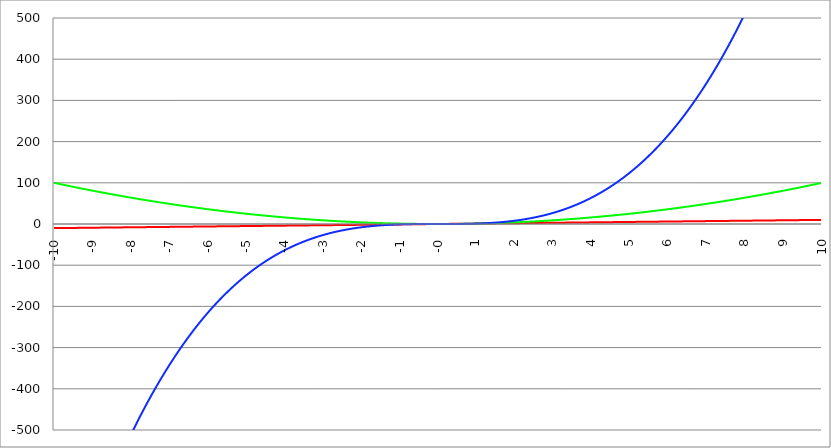
| Category | Series 1 | Series 0 | Series 2 |
|---|---|---|---|
| -10.0 | -10 | 100 | -1000 |
| -9.99 | -9.99 | 99.8 | -997.003 |
| -9.98 | -9.98 | 99.6 | -994.012 |
| -9.97 | -9.97 | 99.401 | -991.027 |
| -9.96 | -9.96 | 99.202 | -988.048 |
| -9.95 | -9.95 | 99.003 | -985.075 |
| -9.940000000000001 | -9.94 | 98.804 | -982.108 |
| -9.930000000000001 | -9.93 | 98.605 | -979.147 |
| -9.920000000000002 | -9.92 | 98.406 | -976.191 |
| -9.91 | -9.91 | 98.208 | -973.242 |
| -9.900000000000002 | -9.9 | 98.01 | -970.299 |
| -9.890000000000002 | -9.89 | 97.812 | -967.362 |
| -9.880000000000003 | -9.88 | 97.614 | -964.43 |
| -9.870000000000003 | -9.87 | 97.417 | -961.505 |
| -9.860000000000001 | -9.86 | 97.22 | -958.585 |
| -9.850000000000003 | -9.85 | 97.023 | -955.672 |
| -9.840000000000003 | -9.84 | 96.826 | -952.764 |
| -9.830000000000004 | -9.83 | 96.629 | -949.862 |
| -9.820000000000004 | -9.82 | 96.432 | -946.966 |
| -9.810000000000004 | -9.81 | 96.236 | -944.076 |
| -9.800000000000004 | -9.8 | 96.04 | -941.192 |
| -9.790000000000004 | -9.79 | 95.844 | -938.314 |
| -9.780000000000005 | -9.78 | 95.648 | -935.441 |
| -9.770000000000005 | -9.77 | 95.453 | -932.575 |
| -9.760000000000005 | -9.76 | 95.258 | -929.714 |
| -9.750000000000005 | -9.75 | 95.063 | -926.859 |
| -9.740000000000006 | -9.74 | 94.868 | -924.01 |
| -9.730000000000006 | -9.73 | 94.673 | -921.167 |
| -9.720000000000006 | -9.72 | 94.478 | -918.33 |
| -9.710000000000006 | -9.71 | 94.284 | -915.499 |
| -9.700000000000006 | -9.7 | 94.09 | -912.673 |
| -9.690000000000007 | -9.69 | 93.896 | -909.853 |
| -9.680000000000007 | -9.68 | 93.702 | -907.039 |
| -9.670000000000007 | -9.67 | 93.509 | -904.231 |
| -9.660000000000007 | -9.66 | 93.316 | -901.429 |
| -9.650000000000007 | -9.65 | 93.123 | -898.632 |
| -9.640000000000008 | -9.64 | 92.93 | -895.841 |
| -9.630000000000008 | -9.63 | 92.737 | -893.056 |
| -9.620000000000008 | -9.62 | 92.544 | -890.277 |
| -9.610000000000008 | -9.61 | 92.352 | -887.504 |
| -9.600000000000009 | -9.6 | 92.16 | -884.736 |
| -9.590000000000009 | -9.59 | 91.968 | -881.974 |
| -9.580000000000007 | -9.58 | 91.776 | -879.218 |
| -9.57000000000001 | -9.57 | 91.585 | -876.467 |
| -9.56000000000001 | -9.56 | 91.394 | -873.723 |
| -9.55000000000001 | -9.55 | 91.203 | -870.984 |
| -9.54000000000001 | -9.54 | 91.012 | -868.251 |
| -9.53000000000001 | -9.53 | 90.821 | -865.523 |
| -9.52000000000001 | -9.52 | 90.63 | -862.801 |
| -9.51000000000001 | -9.51 | 90.44 | -860.085 |
| -9.50000000000001 | -9.5 | 90.25 | -857.375 |
| -9.49000000000001 | -9.49 | 90.06 | -854.67 |
| -9.48000000000001 | -9.48 | 89.87 | -851.971 |
| -9.47000000000001 | -9.47 | 89.681 | -849.278 |
| -9.46000000000001 | -9.46 | 89.492 | -846.591 |
| -9.45000000000001 | -9.45 | 89.303 | -843.909 |
| -9.44000000000001 | -9.44 | 89.114 | -841.232 |
| -9.430000000000012 | -9.43 | 88.925 | -838.562 |
| -9.420000000000012 | -9.42 | 88.736 | -835.897 |
| -9.410000000000013 | -9.41 | 88.548 | -833.238 |
| -9.400000000000013 | -9.4 | 88.36 | -830.584 |
| -9.390000000000011 | -9.39 | 88.172 | -827.936 |
| -9.380000000000013 | -9.38 | 87.984 | -825.294 |
| -9.370000000000013 | -9.37 | 87.797 | -822.657 |
| -9.360000000000014 | -9.36 | 87.61 | -820.026 |
| -9.350000000000014 | -9.35 | 87.423 | -817.4 |
| -9.340000000000014 | -9.34 | 87.236 | -814.781 |
| -9.330000000000014 | -9.33 | 87.049 | -812.166 |
| -9.320000000000014 | -9.32 | 86.862 | -809.558 |
| -9.310000000000015 | -9.31 | 86.676 | -806.954 |
| -9.300000000000013 | -9.3 | 86.49 | -804.357 |
| -9.290000000000015 | -9.29 | 86.304 | -801.765 |
| -9.280000000000015 | -9.28 | 86.118 | -799.179 |
| -9.270000000000016 | -9.27 | 85.933 | -796.598 |
| -9.260000000000016 | -9.26 | 85.748 | -794.023 |
| -9.250000000000014 | -9.25 | 85.563 | -791.453 |
| -9.240000000000016 | -9.24 | 85.378 | -788.889 |
| -9.230000000000016 | -9.23 | 85.193 | -786.33 |
| -9.220000000000017 | -9.22 | 85.008 | -783.777 |
| -9.210000000000017 | -9.21 | 84.824 | -781.23 |
| -9.200000000000017 | -9.2 | 84.64 | -778.688 |
| -9.190000000000017 | -9.19 | 84.456 | -776.152 |
| -9.180000000000017 | -9.18 | 84.272 | -773.621 |
| -9.170000000000018 | -9.17 | 84.089 | -771.095 |
| -9.160000000000016 | -9.16 | 83.906 | -768.575 |
| -9.150000000000018 | -9.15 | 83.723 | -766.061 |
| -9.140000000000018 | -9.14 | 83.54 | -763.552 |
| -9.130000000000019 | -9.13 | 83.357 | -761.048 |
| -9.120000000000019 | -9.12 | 83.174 | -758.551 |
| -9.110000000000017 | -9.11 | 82.992 | -756.058 |
| -9.10000000000002 | -9.1 | 82.81 | -753.571 |
| -9.09000000000002 | -9.09 | 82.628 | -751.089 |
| -9.08000000000002 | -9.08 | 82.446 | -748.613 |
| -9.07000000000002 | -9.07 | 82.265 | -746.143 |
| -9.06000000000002 | -9.06 | 82.084 | -743.677 |
| -9.05000000000002 | -9.05 | 81.903 | -741.218 |
| -9.04000000000002 | -9.04 | 81.722 | -738.763 |
| -9.03000000000002 | -9.03 | 81.541 | -736.314 |
| -9.020000000000021 | -9.02 | 81.36 | -733.871 |
| -9.010000000000021 | -9.01 | 81.18 | -731.433 |
| -9.000000000000021 | -9 | 81 | -729 |
| -8.990000000000022 | -8.99 | 80.82 | -726.573 |
| -8.980000000000022 | -8.98 | 80.64 | -724.151 |
| -8.97000000000002 | -8.97 | 80.461 | -721.734 |
| -8.960000000000022 | -8.96 | 80.282 | -719.323 |
| -8.950000000000022 | -8.95 | 80.103 | -716.917 |
| -8.940000000000023 | -8.94 | 79.924 | -714.517 |
| -8.930000000000023 | -8.93 | 79.745 | -712.122 |
| -8.920000000000023 | -8.92 | 79.566 | -709.732 |
| -8.910000000000023 | -8.91 | 79.388 | -707.348 |
| -8.900000000000023 | -8.9 | 79.21 | -704.969 |
| -8.890000000000024 | -8.89 | 79.032 | -702.595 |
| -8.880000000000024 | -8.88 | 78.854 | -700.227 |
| -8.870000000000024 | -8.87 | 78.677 | -697.864 |
| -8.860000000000024 | -8.86 | 78.5 | -695.506 |
| -8.850000000000025 | -8.85 | 78.323 | -693.154 |
| -8.840000000000025 | -8.84 | 78.146 | -690.807 |
| -8.830000000000025 | -8.83 | 77.969 | -688.465 |
| -8.820000000000025 | -8.82 | 77.792 | -686.129 |
| -8.810000000000025 | -8.81 | 77.616 | -683.798 |
| -8.800000000000026 | -8.8 | 77.44 | -681.472 |
| -8.790000000000026 | -8.79 | 77.264 | -679.151 |
| -8.780000000000026 | -8.78 | 77.088 | -676.836 |
| -8.770000000000026 | -8.77 | 76.913 | -674.526 |
| -8.760000000000026 | -8.76 | 76.738 | -672.221 |
| -8.750000000000027 | -8.75 | 76.563 | -669.922 |
| -8.740000000000027 | -8.74 | 76.388 | -667.628 |
| -8.730000000000027 | -8.73 | 76.213 | -665.339 |
| -8.720000000000027 | -8.72 | 76.038 | -663.055 |
| -8.710000000000027 | -8.71 | 75.864 | -660.776 |
| -8.700000000000028 | -8.7 | 75.69 | -658.503 |
| -8.690000000000028 | -8.69 | 75.516 | -656.235 |
| -8.680000000000028 | -8.68 | 75.342 | -653.972 |
| -8.670000000000028 | -8.67 | 75.169 | -651.714 |
| -8.660000000000029 | -8.66 | 74.996 | -649.462 |
| -8.650000000000029 | -8.65 | 74.823 | -647.215 |
| -8.640000000000029 | -8.64 | 74.65 | -644.973 |
| -8.63000000000003 | -8.63 | 74.477 | -642.736 |
| -8.62000000000003 | -8.62 | 74.304 | -640.504 |
| -8.61000000000003 | -8.61 | 74.132 | -638.277 |
| -8.60000000000003 | -8.6 | 73.96 | -636.056 |
| -8.59000000000003 | -8.59 | 73.788 | -633.84 |
| -8.58000000000003 | -8.58 | 73.616 | -631.629 |
| -8.57000000000003 | -8.57 | 73.445 | -629.423 |
| -8.56000000000003 | -8.56 | 73.274 | -627.222 |
| -8.55000000000003 | -8.55 | 73.103 | -625.026 |
| -8.540000000000031 | -8.54 | 72.932 | -622.836 |
| -8.530000000000031 | -8.53 | 72.761 | -620.65 |
| -8.520000000000032 | -8.52 | 72.59 | -618.47 |
| -8.510000000000032 | -8.51 | 72.42 | -616.295 |
| -8.50000000000003 | -8.5 | 72.25 | -614.125 |
| -8.490000000000032 | -8.49 | 72.08 | -611.96 |
| -8.480000000000032 | -8.48 | 71.91 | -609.8 |
| -8.470000000000033 | -8.47 | 71.741 | -607.645 |
| -8.460000000000033 | -8.46 | 71.572 | -605.496 |
| -8.450000000000033 | -8.45 | 71.403 | -603.351 |
| -8.440000000000033 | -8.44 | 71.234 | -601.212 |
| -8.430000000000033 | -8.43 | 71.065 | -599.077 |
| -8.420000000000034 | -8.42 | 70.896 | -596.948 |
| -8.410000000000032 | -8.41 | 70.728 | -594.823 |
| -8.400000000000034 | -8.4 | 70.56 | -592.704 |
| -8.390000000000034 | -8.39 | 70.392 | -590.59 |
| -8.380000000000035 | -8.38 | 70.224 | -588.48 |
| -8.370000000000035 | -8.37 | 70.057 | -586.376 |
| -8.360000000000033 | -8.36 | 69.89 | -584.277 |
| -8.350000000000035 | -8.35 | 69.723 | -582.183 |
| -8.340000000000035 | -8.34 | 69.556 | -580.094 |
| -8.330000000000036 | -8.33 | 69.389 | -578.01 |
| -8.320000000000036 | -8.32 | 69.222 | -575.93 |
| -8.310000000000034 | -8.31 | 69.056 | -573.856 |
| -8.300000000000036 | -8.3 | 68.89 | -571.787 |
| -8.290000000000036 | -8.29 | 68.724 | -569.723 |
| -8.280000000000037 | -8.28 | 68.558 | -567.664 |
| -8.270000000000037 | -8.27 | 68.393 | -565.609 |
| -8.260000000000037 | -8.26 | 68.228 | -563.56 |
| -8.250000000000037 | -8.25 | 68.063 | -561.516 |
| -8.240000000000038 | -8.24 | 67.898 | -559.476 |
| -8.230000000000038 | -8.23 | 67.733 | -557.442 |
| -8.220000000000038 | -8.22 | 67.568 | -555.412 |
| -8.210000000000038 | -8.21 | 67.404 | -553.388 |
| -8.200000000000038 | -8.2 | 67.24 | -551.368 |
| -8.190000000000039 | -8.19 | 67.076 | -549.353 |
| -8.180000000000039 | -8.18 | 66.912 | -547.343 |
| -8.170000000000037 | -8.17 | 66.749 | -545.339 |
| -8.16000000000004 | -8.16 | 66.586 | -543.338 |
| -8.15000000000004 | -8.15 | 66.423 | -541.343 |
| -8.14000000000004 | -8.14 | 66.26 | -539.353 |
| -8.13000000000004 | -8.13 | 66.097 | -537.368 |
| -8.12000000000004 | -8.12 | 65.934 | -535.387 |
| -8.11000000000004 | -8.11 | 65.772 | -533.412 |
| -8.10000000000004 | -8.1 | 65.61 | -531.441 |
| -8.09000000000004 | -8.09 | 65.448 | -529.475 |
| -8.08000000000004 | -8.08 | 65.286 | -527.514 |
| -8.07000000000004 | -8.07 | 65.125 | -525.558 |
| -8.06000000000004 | -8.06 | 64.964 | -523.607 |
| -8.05000000000004 | -8.05 | 64.803 | -521.66 |
| -8.040000000000042 | -8.04 | 64.642 | -519.718 |
| -8.03000000000004 | -8.03 | 64.481 | -517.782 |
| -8.020000000000042 | -8.02 | 64.32 | -515.85 |
| -8.010000000000042 | -8.01 | 64.16 | -513.922 |
| -8.000000000000043 | -8 | 64 | -512 |
| -7.990000000000043 | -7.99 | 63.84 | -510.082 |
| -7.980000000000043 | -7.98 | 63.68 | -508.17 |
| -7.970000000000043 | -7.97 | 63.521 | -506.262 |
| -7.960000000000043 | -7.96 | 63.362 | -504.358 |
| -7.950000000000044 | -7.95 | 63.203 | -502.46 |
| -7.940000000000044 | -7.94 | 63.044 | -500.566 |
| -7.930000000000044 | -7.93 | 62.885 | -498.677 |
| -7.920000000000044 | -7.92 | 62.726 | -496.793 |
| -7.910000000000044 | -7.91 | 62.568 | -494.914 |
| -7.900000000000044 | -7.9 | 62.41 | -493.039 |
| -7.890000000000045 | -7.89 | 62.252 | -491.169 |
| -7.880000000000045 | -7.88 | 62.094 | -489.304 |
| -7.870000000000045 | -7.87 | 61.937 | -487.443 |
| -7.860000000000046 | -7.86 | 61.78 | -485.588 |
| -7.850000000000046 | -7.85 | 61.623 | -483.737 |
| -7.840000000000046 | -7.84 | 61.466 | -481.89 |
| -7.830000000000046 | -7.83 | 61.309 | -480.049 |
| -7.820000000000046 | -7.82 | 61.152 | -478.212 |
| -7.810000000000047 | -7.81 | 60.996 | -476.38 |
| -7.800000000000047 | -7.8 | 60.84 | -474.552 |
| -7.790000000000047 | -7.79 | 60.684 | -472.729 |
| -7.780000000000047 | -7.78 | 60.528 | -470.911 |
| -7.770000000000047 | -7.77 | 60.373 | -469.097 |
| -7.760000000000048 | -7.76 | 60.218 | -467.289 |
| -7.750000000000048 | -7.75 | 60.063 | -465.484 |
| -7.740000000000048 | -7.74 | 59.908 | -463.685 |
| -7.730000000000048 | -7.73 | 59.753 | -461.89 |
| -7.720000000000049 | -7.72 | 59.598 | -460.1 |
| -7.710000000000049 | -7.71 | 59.444 | -458.314 |
| -7.700000000000049 | -7.7 | 59.29 | -456.533 |
| -7.690000000000049 | -7.69 | 59.136 | -454.757 |
| -7.680000000000049 | -7.68 | 58.982 | -452.985 |
| -7.67000000000005 | -7.67 | 58.829 | -451.218 |
| -7.66000000000005 | -7.66 | 58.676 | -449.455 |
| -7.65000000000005 | -7.65 | 58.523 | -447.697 |
| -7.64000000000005 | -7.64 | 58.37 | -445.944 |
| -7.63000000000005 | -7.63 | 58.217 | -444.195 |
| -7.620000000000051 | -7.62 | 58.064 | -442.451 |
| -7.610000000000051 | -7.61 | 57.912 | -440.711 |
| -7.600000000000051 | -7.6 | 57.76 | -438.976 |
| -7.590000000000051 | -7.59 | 57.608 | -437.245 |
| -7.580000000000052 | -7.58 | 57.456 | -435.52 |
| -7.570000000000052 | -7.57 | 57.305 | -433.798 |
| -7.560000000000052 | -7.56 | 57.154 | -432.081 |
| -7.550000000000052 | -7.55 | 57.003 | -430.369 |
| -7.540000000000052 | -7.54 | 56.852 | -428.661 |
| -7.530000000000053 | -7.53 | 56.701 | -426.958 |
| -7.520000000000053 | -7.52 | 56.55 | -425.259 |
| -7.510000000000053 | -7.51 | 56.4 | -423.565 |
| -7.500000000000053 | -7.5 | 56.25 | -421.875 |
| -7.490000000000053 | -7.49 | 56.1 | -420.19 |
| -7.480000000000054 | -7.48 | 55.95 | -418.509 |
| -7.470000000000054 | -7.47 | 55.801 | -416.833 |
| -7.460000000000054 | -7.46 | 55.652 | -415.161 |
| -7.450000000000054 | -7.45 | 55.503 | -413.494 |
| -7.440000000000054 | -7.44 | 55.354 | -411.831 |
| -7.430000000000054 | -7.43 | 55.205 | -410.172 |
| -7.420000000000055 | -7.42 | 55.056 | -408.518 |
| -7.410000000000055 | -7.41 | 54.908 | -406.869 |
| -7.400000000000055 | -7.4 | 54.76 | -405.224 |
| -7.390000000000056 | -7.39 | 54.612 | -403.583 |
| -7.380000000000056 | -7.38 | 54.464 | -401.947 |
| -7.370000000000056 | -7.37 | 54.317 | -400.316 |
| -7.360000000000056 | -7.36 | 54.17 | -398.688 |
| -7.350000000000056 | -7.35 | 54.023 | -397.065 |
| -7.340000000000057 | -7.34 | 53.876 | -395.447 |
| -7.330000000000057 | -7.33 | 53.729 | -393.833 |
| -7.320000000000057 | -7.32 | 53.582 | -392.223 |
| -7.310000000000057 | -7.31 | 53.436 | -390.618 |
| -7.300000000000058 | -7.3 | 53.29 | -389.017 |
| -7.290000000000058 | -7.29 | 53.144 | -387.42 |
| -7.280000000000058 | -7.28 | 52.998 | -385.828 |
| -7.270000000000058 | -7.27 | 52.853 | -384.241 |
| -7.260000000000058 | -7.26 | 52.708 | -382.657 |
| -7.250000000000059 | -7.25 | 52.563 | -381.078 |
| -7.240000000000059 | -7.24 | 52.418 | -379.503 |
| -7.23000000000006 | -7.23 | 52.273 | -377.933 |
| -7.220000000000059 | -7.22 | 52.128 | -376.367 |
| -7.210000000000059 | -7.21 | 51.984 | -374.805 |
| -7.20000000000006 | -7.2 | 51.84 | -373.248 |
| -7.19000000000006 | -7.19 | 51.696 | -371.695 |
| -7.18000000000006 | -7.18 | 51.552 | -370.146 |
| -7.17000000000006 | -7.17 | 51.409 | -368.602 |
| -7.160000000000061 | -7.16 | 51.266 | -367.062 |
| -7.150000000000061 | -7.15 | 51.123 | -365.526 |
| -7.140000000000061 | -7.14 | 50.98 | -363.994 |
| -7.130000000000061 | -7.13 | 50.837 | -362.467 |
| -7.120000000000061 | -7.12 | 50.694 | -360.944 |
| -7.110000000000062 | -7.11 | 50.552 | -359.425 |
| -7.100000000000062 | -7.1 | 50.41 | -357.911 |
| -7.090000000000062 | -7.09 | 50.268 | -356.401 |
| -7.080000000000062 | -7.08 | 50.126 | -354.895 |
| -7.070000000000062 | -7.07 | 49.985 | -353.393 |
| -7.060000000000063 | -7.06 | 49.844 | -351.896 |
| -7.050000000000063 | -7.05 | 49.703 | -350.403 |
| -7.040000000000063 | -7.04 | 49.562 | -348.914 |
| -7.030000000000063 | -7.03 | 49.421 | -347.429 |
| -7.020000000000064 | -7.02 | 49.28 | -345.948 |
| -7.010000000000064 | -7.01 | 49.14 | -344.472 |
| -7.000000000000064 | -7 | 49 | -343 |
| -6.990000000000064 | -6.99 | 48.86 | -341.532 |
| -6.980000000000064 | -6.98 | 48.72 | -340.068 |
| -6.970000000000064 | -6.97 | 48.581 | -338.609 |
| -6.960000000000064 | -6.96 | 48.442 | -337.154 |
| -6.950000000000064 | -6.95 | 48.303 | -335.702 |
| -6.940000000000065 | -6.94 | 48.164 | -334.255 |
| -6.930000000000065 | -6.93 | 48.025 | -332.813 |
| -6.920000000000065 | -6.92 | 47.886 | -331.374 |
| -6.910000000000065 | -6.91 | 47.748 | -329.939 |
| -6.900000000000066 | -6.9 | 47.61 | -328.509 |
| -6.890000000000066 | -6.89 | 47.472 | -327.083 |
| -6.880000000000066 | -6.88 | 47.334 | -325.661 |
| -6.870000000000066 | -6.87 | 47.197 | -324.243 |
| -6.860000000000067 | -6.86 | 47.06 | -322.829 |
| -6.850000000000067 | -6.85 | 46.923 | -321.419 |
| -6.840000000000067 | -6.84 | 46.786 | -320.014 |
| -6.830000000000067 | -6.83 | 46.649 | -318.612 |
| -6.820000000000068 | -6.82 | 46.512 | -317.215 |
| -6.810000000000068 | -6.81 | 46.376 | -315.821 |
| -6.800000000000068 | -6.8 | 46.24 | -314.432 |
| -6.790000000000068 | -6.79 | 46.104 | -313.047 |
| -6.780000000000068 | -6.78 | 45.968 | -311.666 |
| -6.770000000000068 | -6.77 | 45.833 | -310.289 |
| -6.760000000000069 | -6.76 | 45.698 | -308.916 |
| -6.75000000000007 | -6.75 | 45.563 | -307.547 |
| -6.74000000000007 | -6.74 | 45.428 | -306.182 |
| -6.73000000000007 | -6.73 | 45.293 | -304.821 |
| -6.72000000000007 | -6.72 | 45.158 | -303.464 |
| -6.71000000000007 | -6.71 | 45.024 | -302.112 |
| -6.70000000000007 | -6.7 | 44.89 | -300.763 |
| -6.69000000000007 | -6.69 | 44.756 | -299.418 |
| -6.680000000000071 | -6.68 | 44.622 | -298.078 |
| -6.670000000000071 | -6.67 | 44.489 | -296.741 |
| -6.660000000000071 | -6.66 | 44.356 | -295.408 |
| -6.650000000000071 | -6.65 | 44.223 | -294.08 |
| -6.640000000000072 | -6.64 | 44.09 | -292.755 |
| -6.630000000000072 | -6.63 | 43.957 | -291.434 |
| -6.620000000000072 | -6.62 | 43.824 | -290.118 |
| -6.610000000000072 | -6.61 | 43.692 | -288.805 |
| -6.600000000000072 | -6.6 | 43.56 | -287.496 |
| -6.590000000000073 | -6.59 | 43.428 | -286.191 |
| -6.580000000000073 | -6.58 | 43.296 | -284.89 |
| -6.570000000000073 | -6.57 | 43.165 | -283.593 |
| -6.560000000000073 | -6.56 | 43.034 | -282.3 |
| -6.550000000000074 | -6.55 | 42.903 | -281.011 |
| -6.540000000000074 | -6.54 | 42.772 | -279.726 |
| -6.530000000000074 | -6.53 | 42.641 | -278.445 |
| -6.520000000000074 | -6.52 | 42.51 | -277.168 |
| -6.510000000000074 | -6.51 | 42.38 | -275.894 |
| -6.500000000000074 | -6.5 | 42.25 | -274.625 |
| -6.490000000000074 | -6.49 | 42.12 | -273.359 |
| -6.480000000000074 | -6.48 | 41.99 | -272.098 |
| -6.470000000000075 | -6.47 | 41.861 | -270.84 |
| -6.460000000000075 | -6.46 | 41.732 | -269.586 |
| -6.450000000000075 | -6.45 | 41.603 | -268.336 |
| -6.440000000000075 | -6.44 | 41.474 | -267.09 |
| -6.430000000000076 | -6.43 | 41.345 | -265.848 |
| -6.420000000000076 | -6.42 | 41.216 | -264.609 |
| -6.410000000000076 | -6.41 | 41.088 | -263.375 |
| -6.400000000000076 | -6.4 | 40.96 | -262.144 |
| -6.390000000000077 | -6.39 | 40.832 | -260.917 |
| -6.380000000000077 | -6.38 | 40.704 | -259.694 |
| -6.370000000000077 | -6.37 | 40.577 | -258.475 |
| -6.360000000000078 | -6.36 | 40.45 | -257.259 |
| -6.350000000000078 | -6.35 | 40.323 | -256.048 |
| -6.340000000000078 | -6.34 | 40.196 | -254.84 |
| -6.330000000000078 | -6.33 | 40.069 | -253.636 |
| -6.320000000000078 | -6.32 | 39.942 | -252.436 |
| -6.310000000000079 | -6.31 | 39.816 | -251.24 |
| -6.300000000000079 | -6.3 | 39.69 | -250.047 |
| -6.29000000000008 | -6.29 | 39.564 | -248.858 |
| -6.28000000000008 | -6.28 | 39.438 | -247.673 |
| -6.27000000000008 | -6.27 | 39.313 | -246.492 |
| -6.26000000000008 | -6.26 | 39.188 | -245.314 |
| -6.25000000000008 | -6.25 | 39.063 | -244.141 |
| -6.24000000000008 | -6.24 | 38.938 | -242.971 |
| -6.23000000000008 | -6.23 | 38.813 | -241.804 |
| -6.220000000000081 | -6.22 | 38.688 | -240.642 |
| -6.210000000000081 | -6.21 | 38.564 | -239.483 |
| -6.200000000000081 | -6.2 | 38.44 | -238.328 |
| -6.190000000000081 | -6.19 | 38.316 | -237.177 |
| -6.180000000000081 | -6.18 | 38.192 | -236.029 |
| -6.170000000000082 | -6.17 | 38.069 | -234.885 |
| -6.160000000000082 | -6.16 | 37.946 | -233.745 |
| -6.150000000000082 | -6.15 | 37.823 | -232.608 |
| -6.140000000000082 | -6.14 | 37.7 | -231.476 |
| -6.130000000000082 | -6.13 | 37.577 | -230.346 |
| -6.120000000000083 | -6.12 | 37.454 | -229.221 |
| -6.110000000000083 | -6.11 | 37.332 | -228.099 |
| -6.100000000000083 | -6.1 | 37.21 | -226.981 |
| -6.090000000000083 | -6.09 | 37.088 | -225.867 |
| -6.080000000000084 | -6.08 | 36.966 | -224.756 |
| -6.070000000000084 | -6.07 | 36.845 | -223.649 |
| -6.060000000000084 | -6.06 | 36.724 | -222.545 |
| -6.050000000000084 | -6.05 | 36.603 | -221.445 |
| -6.040000000000084 | -6.04 | 36.482 | -220.349 |
| -6.030000000000084 | -6.03 | 36.361 | -219.256 |
| -6.020000000000085 | -6.02 | 36.24 | -218.167 |
| -6.010000000000085 | -6.01 | 36.12 | -217.082 |
| -6.000000000000085 | -6 | 36 | -216 |
| -5.990000000000085 | -5.99 | 35.88 | -214.922 |
| -5.980000000000085 | -5.98 | 35.76 | -213.847 |
| -5.970000000000085 | -5.97 | 35.641 | -212.776 |
| -5.960000000000086 | -5.96 | 35.522 | -211.709 |
| -5.950000000000086 | -5.95 | 35.403 | -210.645 |
| -5.940000000000086 | -5.94 | 35.284 | -209.585 |
| -5.930000000000086 | -5.93 | 35.165 | -208.528 |
| -5.920000000000087 | -5.92 | 35.046 | -207.475 |
| -5.910000000000087 | -5.91 | 34.928 | -206.425 |
| -5.900000000000087 | -5.9 | 34.81 | -205.379 |
| -5.890000000000088 | -5.89 | 34.692 | -204.336 |
| -5.880000000000088 | -5.88 | 34.574 | -203.297 |
| -5.870000000000088 | -5.87 | 34.457 | -202.262 |
| -5.860000000000088 | -5.86 | 34.34 | -201.23 |
| -5.850000000000088 | -5.85 | 34.223 | -200.202 |
| -5.840000000000089 | -5.84 | 34.106 | -199.177 |
| -5.830000000000089 | -5.83 | 33.989 | -198.155 |
| -5.820000000000089 | -5.82 | 33.872 | -197.137 |
| -5.810000000000089 | -5.81 | 33.756 | -196.123 |
| -5.800000000000089 | -5.8 | 33.64 | -195.112 |
| -5.79000000000009 | -5.79 | 33.524 | -194.105 |
| -5.78000000000009 | -5.78 | 33.408 | -193.101 |
| -5.77000000000009 | -5.77 | 33.293 | -192.1 |
| -5.76000000000009 | -5.76 | 33.178 | -191.103 |
| -5.750000000000091 | -5.75 | 33.063 | -190.109 |
| -5.740000000000091 | -5.74 | 32.948 | -189.119 |
| -5.730000000000091 | -5.73 | 32.833 | -188.133 |
| -5.720000000000091 | -5.72 | 32.718 | -187.149 |
| -5.710000000000091 | -5.71 | 32.604 | -186.169 |
| -5.700000000000092 | -5.7 | 32.49 | -185.193 |
| -5.690000000000092 | -5.69 | 32.376 | -184.22 |
| -5.680000000000092 | -5.68 | 32.262 | -183.25 |
| -5.670000000000092 | -5.67 | 32.149 | -182.284 |
| -5.660000000000092 | -5.66 | 32.036 | -181.321 |
| -5.650000000000093 | -5.65 | 31.923 | -180.362 |
| -5.640000000000093 | -5.64 | 31.81 | -179.406 |
| -5.630000000000093 | -5.63 | 31.697 | -178.454 |
| -5.620000000000093 | -5.62 | 31.584 | -177.504 |
| -5.610000000000093 | -5.61 | 31.472 | -176.558 |
| -5.600000000000094 | -5.6 | 31.36 | -175.616 |
| -5.590000000000094 | -5.59 | 31.248 | -174.677 |
| -5.580000000000094 | -5.58 | 31.136 | -173.741 |
| -5.570000000000094 | -5.57 | 31.025 | -172.809 |
| -5.560000000000095 | -5.56 | 30.914 | -171.88 |
| -5.550000000000095 | -5.55 | 30.803 | -170.954 |
| -5.540000000000095 | -5.54 | 30.692 | -170.031 |
| -5.530000000000095 | -5.53 | 30.581 | -169.112 |
| -5.520000000000095 | -5.52 | 30.47 | -168.197 |
| -5.510000000000096 | -5.51 | 30.36 | -167.284 |
| -5.500000000000096 | -5.5 | 30.25 | -166.375 |
| -5.490000000000096 | -5.49 | 30.14 | -165.469 |
| -5.480000000000096 | -5.48 | 30.03 | -164.567 |
| -5.470000000000096 | -5.47 | 29.921 | -163.667 |
| -5.460000000000097 | -5.46 | 29.812 | -162.771 |
| -5.450000000000097 | -5.45 | 29.703 | -161.879 |
| -5.440000000000097 | -5.44 | 29.594 | -160.989 |
| -5.430000000000097 | -5.43 | 29.485 | -160.103 |
| -5.420000000000098 | -5.42 | 29.376 | -159.22 |
| -5.410000000000098 | -5.41 | 29.268 | -158.34 |
| -5.400000000000098 | -5.4 | 29.16 | -157.464 |
| -5.390000000000098 | -5.39 | 29.052 | -156.591 |
| -5.380000000000098 | -5.38 | 28.944 | -155.721 |
| -5.370000000000099 | -5.37 | 28.837 | -154.854 |
| -5.360000000000099 | -5.36 | 28.73 | -153.991 |
| -5.350000000000099 | -5.35 | 28.623 | -153.13 |
| -5.340000000000099 | -5.34 | 28.516 | -152.273 |
| -5.330000000000099 | -5.33 | 28.409 | -151.419 |
| -5.3200000000001 | -5.32 | 28.302 | -150.569 |
| -5.3100000000001 | -5.31 | 28.196 | -149.721 |
| -5.3000000000001 | -5.3 | 28.09 | -148.877 |
| -5.2900000000001 | -5.29 | 27.984 | -148.036 |
| -5.2800000000001 | -5.28 | 27.878 | -147.198 |
| -5.2700000000001 | -5.27 | 27.773 | -146.363 |
| -5.260000000000101 | -5.26 | 27.668 | -145.532 |
| -5.250000000000101 | -5.25 | 27.563 | -144.703 |
| -5.240000000000101 | -5.24 | 27.458 | -143.878 |
| -5.230000000000101 | -5.23 | 27.353 | -143.056 |
| -5.220000000000102 | -5.22 | 27.248 | -142.237 |
| -5.210000000000102 | -5.21 | 27.144 | -141.421 |
| -5.200000000000102 | -5.2 | 27.04 | -140.608 |
| -5.190000000000103 | -5.19 | 26.936 | -139.798 |
| -5.180000000000103 | -5.18 | 26.832 | -138.992 |
| -5.170000000000103 | -5.17 | 26.729 | -138.188 |
| -5.160000000000103 | -5.16 | 26.626 | -137.388 |
| -5.150000000000103 | -5.15 | 26.523 | -136.591 |
| -5.140000000000104 | -5.14 | 26.42 | -135.797 |
| -5.130000000000104 | -5.13 | 26.317 | -135.006 |
| -5.120000000000104 | -5.12 | 26.214 | -134.218 |
| -5.110000000000104 | -5.11 | 26.112 | -133.433 |
| -5.100000000000104 | -5.1 | 26.01 | -132.651 |
| -5.090000000000104 | -5.09 | 25.908 | -131.872 |
| -5.080000000000104 | -5.08 | 25.806 | -131.097 |
| -5.070000000000105 | -5.07 | 25.705 | -130.324 |
| -5.060000000000105 | -5.06 | 25.604 | -129.554 |
| -5.050000000000105 | -5.05 | 25.503 | -128.788 |
| -5.040000000000105 | -5.04 | 25.402 | -128.024 |
| -5.030000000000105 | -5.03 | 25.301 | -127.264 |
| -5.020000000000106 | -5.02 | 25.2 | -126.506 |
| -5.010000000000106 | -5.01 | 25.1 | -125.752 |
| -5.000000000000106 | -5 | 25 | -125 |
| -4.990000000000106 | -4.99 | 24.9 | -124.251 |
| -4.980000000000106 | -4.98 | 24.8 | -123.506 |
| -4.970000000000107 | -4.97 | 24.701 | -122.763 |
| -4.960000000000107 | -4.96 | 24.602 | -122.024 |
| -4.950000000000107 | -4.95 | 24.503 | -121.287 |
| -4.940000000000107 | -4.94 | 24.404 | -120.554 |
| -4.930000000000108 | -4.93 | 24.305 | -119.823 |
| -4.920000000000108 | -4.92 | 24.206 | -119.095 |
| -4.910000000000108 | -4.91 | 24.108 | -118.371 |
| -4.900000000000108 | -4.9 | 24.01 | -117.649 |
| -4.890000000000109 | -4.89 | 23.912 | -116.93 |
| -4.88000000000011 | -4.88 | 23.814 | -116.214 |
| -4.87000000000011 | -4.87 | 23.717 | -115.501 |
| -4.86000000000011 | -4.86 | 23.62 | -114.791 |
| -4.85000000000011 | -4.85 | 23.523 | -114.084 |
| -4.84000000000011 | -4.84 | 23.426 | -113.38 |
| -4.83000000000011 | -4.83 | 23.329 | -112.679 |
| -4.82000000000011 | -4.82 | 23.232 | -111.98 |
| -4.810000000000111 | -4.81 | 23.136 | -111.285 |
| -4.800000000000111 | -4.8 | 23.04 | -110.592 |
| -4.790000000000111 | -4.79 | 22.944 | -109.902 |
| -4.780000000000111 | -4.78 | 22.848 | -109.215 |
| -4.770000000000111 | -4.77 | 22.753 | -108.531 |
| -4.760000000000112 | -4.76 | 22.658 | -107.85 |
| -4.750000000000112 | -4.75 | 22.563 | -107.172 |
| -4.740000000000112 | -4.74 | 22.468 | -106.496 |
| -4.730000000000112 | -4.73 | 22.373 | -105.824 |
| -4.720000000000112 | -4.72 | 22.278 | -105.154 |
| -4.710000000000113 | -4.71 | 22.184 | -104.487 |
| -4.700000000000113 | -4.7 | 22.09 | -103.823 |
| -4.690000000000113 | -4.69 | 21.996 | -103.162 |
| -4.680000000000113 | -4.68 | 21.902 | -102.503 |
| -4.670000000000114 | -4.67 | 21.809 | -101.848 |
| -4.660000000000114 | -4.66 | 21.716 | -101.195 |
| -4.650000000000114 | -4.65 | 21.623 | -100.545 |
| -4.640000000000114 | -4.64 | 21.53 | -99.897 |
| -4.630000000000114 | -4.63 | 21.437 | -99.253 |
| -4.620000000000115 | -4.62 | 21.344 | -98.611 |
| -4.610000000000115 | -4.61 | 21.252 | -97.972 |
| -4.600000000000115 | -4.6 | 21.16 | -97.336 |
| -4.590000000000115 | -4.59 | 21.068 | -96.703 |
| -4.580000000000115 | -4.58 | 20.976 | -96.072 |
| -4.570000000000115 | -4.57 | 20.885 | -95.444 |
| -4.560000000000116 | -4.56 | 20.794 | -94.819 |
| -4.550000000000116 | -4.55 | 20.703 | -94.196 |
| -4.540000000000116 | -4.54 | 20.612 | -93.577 |
| -4.530000000000116 | -4.53 | 20.521 | -92.96 |
| -4.520000000000117 | -4.52 | 20.43 | -92.345 |
| -4.510000000000117 | -4.51 | 20.34 | -91.734 |
| -4.500000000000117 | -4.5 | 20.25 | -91.125 |
| -4.490000000000117 | -4.49 | 20.16 | -90.519 |
| -4.480000000000117 | -4.48 | 20.07 | -89.915 |
| -4.470000000000117 | -4.47 | 19.981 | -89.315 |
| -4.460000000000118 | -4.46 | 19.892 | -88.717 |
| -4.450000000000118 | -4.45 | 19.803 | -88.121 |
| -4.440000000000118 | -4.44 | 19.714 | -87.528 |
| -4.430000000000118 | -4.43 | 19.625 | -86.938 |
| -4.420000000000119 | -4.42 | 19.536 | -86.351 |
| -4.41000000000012 | -4.41 | 19.448 | -85.766 |
| -4.40000000000012 | -4.4 | 19.36 | -85.184 |
| -4.39000000000012 | -4.39 | 19.272 | -84.605 |
| -4.38000000000012 | -4.38 | 19.184 | -84.028 |
| -4.37000000000012 | -4.37 | 19.097 | -83.453 |
| -4.36000000000012 | -4.36 | 19.01 | -82.882 |
| -4.35000000000012 | -4.35 | 18.923 | -82.313 |
| -4.34000000000012 | -4.34 | 18.836 | -81.747 |
| -4.33000000000012 | -4.33 | 18.749 | -81.183 |
| -4.320000000000121 | -4.32 | 18.662 | -80.622 |
| -4.310000000000121 | -4.31 | 18.576 | -80.063 |
| -4.300000000000121 | -4.3 | 18.49 | -79.507 |
| -4.290000000000121 | -4.29 | 18.404 | -78.954 |
| -4.280000000000121 | -4.28 | 18.318 | -78.403 |
| -4.270000000000122 | -4.27 | 18.233 | -77.854 |
| -4.260000000000122 | -4.26 | 18.148 | -77.309 |
| -4.250000000000122 | -4.25 | 18.063 | -76.766 |
| -4.240000000000122 | -4.24 | 17.978 | -76.225 |
| -4.230000000000122 | -4.23 | 17.893 | -75.687 |
| -4.220000000000123 | -4.22 | 17.808 | -75.151 |
| -4.210000000000123 | -4.21 | 17.724 | -74.618 |
| -4.200000000000123 | -4.2 | 17.64 | -74.088 |
| -4.190000000000124 | -4.19 | 17.556 | -73.56 |
| -4.180000000000124 | -4.18 | 17.472 | -73.035 |
| -4.170000000000124 | -4.17 | 17.389 | -72.512 |
| -4.160000000000124 | -4.16 | 17.306 | -71.991 |
| -4.150000000000124 | -4.15 | 17.223 | -71.473 |
| -4.140000000000124 | -4.14 | 17.14 | -70.958 |
| -4.130000000000125 | -4.13 | 17.057 | -70.445 |
| -4.120000000000125 | -4.12 | 16.974 | -69.935 |
| -4.110000000000125 | -4.11 | 16.892 | -69.427 |
| -4.100000000000125 | -4.1 | 16.81 | -68.921 |
| -4.090000000000125 | -4.09 | 16.728 | -68.418 |
| -4.080000000000126 | -4.08 | 16.646 | -67.917 |
| -4.070000000000126 | -4.07 | 16.565 | -67.419 |
| -4.060000000000126 | -4.06 | 16.484 | -66.923 |
| -4.050000000000126 | -4.05 | 16.403 | -66.43 |
| -4.040000000000127 | -4.04 | 16.322 | -65.939 |
| -4.030000000000127 | -4.03 | 16.241 | -65.451 |
| -4.020000000000127 | -4.02 | 16.16 | -64.965 |
| -4.010000000000127 | -4.01 | 16.08 | -64.481 |
| -4.000000000000127 | -4 | 16 | -64 |
| -3.990000000000128 | -3.99 | 15.92 | -63.521 |
| -3.980000000000128 | -3.98 | 15.84 | -63.045 |
| -3.970000000000129 | -3.97 | 15.761 | -62.571 |
| -3.960000000000129 | -3.96 | 15.682 | -62.099 |
| -3.950000000000129 | -3.95 | 15.603 | -61.63 |
| -3.940000000000129 | -3.94 | 15.524 | -61.163 |
| -3.930000000000129 | -3.93 | 15.445 | -60.698 |
| -3.92000000000013 | -3.92 | 15.366 | -60.236 |
| -3.91000000000013 | -3.91 | 15.288 | -59.776 |
| -3.90000000000013 | -3.9 | 15.21 | -59.319 |
| -3.89000000000013 | -3.89 | 15.132 | -58.864 |
| -3.88000000000013 | -3.88 | 15.054 | -58.411 |
| -3.870000000000131 | -3.87 | 14.977 | -57.961 |
| -3.860000000000131 | -3.86 | 14.9 | -57.512 |
| -3.850000000000131 | -3.85 | 14.823 | -57.067 |
| -3.840000000000131 | -3.84 | 14.746 | -56.623 |
| -3.830000000000131 | -3.83 | 14.669 | -56.182 |
| -3.820000000000132 | -3.82 | 14.592 | -55.743 |
| -3.810000000000132 | -3.81 | 14.516 | -55.306 |
| -3.800000000000132 | -3.8 | 14.44 | -54.872 |
| -3.790000000000132 | -3.79 | 14.364 | -54.44 |
| -3.780000000000132 | -3.78 | 14.288 | -54.01 |
| -3.770000000000133 | -3.77 | 14.213 | -53.583 |
| -3.760000000000133 | -3.76 | 14.138 | -53.157 |
| -3.750000000000133 | -3.75 | 14.063 | -52.734 |
| -3.740000000000133 | -3.74 | 13.988 | -52.314 |
| -3.730000000000134 | -3.73 | 13.913 | -51.895 |
| -3.720000000000134 | -3.72 | 13.838 | -51.479 |
| -3.710000000000134 | -3.71 | 13.764 | -51.065 |
| -3.700000000000134 | -3.7 | 13.69 | -50.653 |
| -3.690000000000134 | -3.69 | 13.616 | -50.243 |
| -3.680000000000135 | -3.68 | 13.542 | -49.836 |
| -3.670000000000135 | -3.67 | 13.469 | -49.431 |
| -3.660000000000135 | -3.66 | 13.396 | -49.028 |
| -3.650000000000135 | -3.65 | 13.323 | -48.627 |
| -3.640000000000135 | -3.64 | 13.25 | -48.229 |
| -3.630000000000136 | -3.63 | 13.177 | -47.832 |
| -3.620000000000136 | -3.62 | 13.104 | -47.438 |
| -3.610000000000136 | -3.61 | 13.032 | -47.046 |
| -3.600000000000136 | -3.6 | 12.96 | -46.656 |
| -3.590000000000137 | -3.59 | 12.888 | -46.268 |
| -3.580000000000137 | -3.58 | 12.816 | -45.883 |
| -3.570000000000137 | -3.57 | 12.745 | -45.499 |
| -3.560000000000137 | -3.56 | 12.674 | -45.118 |
| -3.550000000000137 | -3.55 | 12.603 | -44.739 |
| -3.540000000000138 | -3.54 | 12.532 | -44.362 |
| -3.530000000000138 | -3.53 | 12.461 | -43.987 |
| -3.520000000000138 | -3.52 | 12.39 | -43.614 |
| -3.510000000000138 | -3.51 | 12.32 | -43.244 |
| -3.500000000000139 | -3.5 | 12.25 | -42.875 |
| -3.490000000000139 | -3.49 | 12.18 | -42.509 |
| -3.480000000000139 | -3.48 | 12.11 | -42.144 |
| -3.470000000000139 | -3.47 | 12.041 | -41.782 |
| -3.460000000000139 | -3.46 | 11.972 | -41.422 |
| -3.45000000000014 | -3.45 | 11.903 | -41.064 |
| -3.44000000000014 | -3.44 | 11.834 | -40.708 |
| -3.43000000000014 | -3.43 | 11.765 | -40.354 |
| -3.42000000000014 | -3.42 | 11.696 | -40.002 |
| -3.41000000000014 | -3.41 | 11.628 | -39.652 |
| -3.400000000000141 | -3.4 | 11.56 | -39.304 |
| -3.390000000000141 | -3.39 | 11.492 | -38.958 |
| -3.380000000000141 | -3.38 | 11.424 | -38.614 |
| -3.370000000000141 | -3.37 | 11.357 | -38.273 |
| -3.360000000000141 | -3.36 | 11.29 | -37.933 |
| -3.350000000000142 | -3.35 | 11.223 | -37.595 |
| -3.340000000000142 | -3.34 | 11.156 | -37.26 |
| -3.330000000000142 | -3.33 | 11.089 | -36.926 |
| -3.320000000000142 | -3.32 | 11.022 | -36.594 |
| -3.310000000000143 | -3.31 | 10.956 | -36.265 |
| -3.300000000000143 | -3.3 | 10.89 | -35.937 |
| -3.290000000000143 | -3.29 | 10.824 | -35.611 |
| -3.280000000000143 | -3.28 | 10.758 | -35.288 |
| -3.270000000000143 | -3.27 | 10.693 | -34.966 |
| -3.260000000000144 | -3.26 | 10.628 | -34.646 |
| -3.250000000000144 | -3.25 | 10.563 | -34.328 |
| -3.240000000000144 | -3.24 | 10.498 | -34.012 |
| -3.230000000000144 | -3.23 | 10.433 | -33.698 |
| -3.220000000000145 | -3.22 | 10.368 | -33.386 |
| -3.210000000000145 | -3.21 | 10.304 | -33.076 |
| -3.200000000000145 | -3.2 | 10.24 | -32.768 |
| -3.190000000000145 | -3.19 | 10.176 | -32.462 |
| -3.180000000000145 | -3.18 | 10.112 | -32.157 |
| -3.170000000000146 | -3.17 | 10.049 | -31.855 |
| -3.160000000000146 | -3.16 | 9.986 | -31.554 |
| -3.150000000000146 | -3.15 | 9.923 | -31.256 |
| -3.140000000000146 | -3.14 | 9.86 | -30.959 |
| -3.130000000000146 | -3.13 | 9.797 | -30.664 |
| -3.120000000000147 | -3.12 | 9.734 | -30.371 |
| -3.110000000000147 | -3.11 | 9.672 | -30.08 |
| -3.100000000000147 | -3.1 | 9.61 | -29.791 |
| -3.090000000000147 | -3.09 | 9.548 | -29.504 |
| -3.080000000000147 | -3.08 | 9.486 | -29.218 |
| -3.070000000000148 | -3.07 | 9.425 | -28.934 |
| -3.060000000000148 | -3.06 | 9.364 | -28.653 |
| -3.050000000000148 | -3.05 | 9.303 | -28.373 |
| -3.040000000000148 | -3.04 | 9.242 | -28.094 |
| -3.030000000000149 | -3.03 | 9.181 | -27.818 |
| -3.020000000000149 | -3.02 | 9.12 | -27.544 |
| -3.010000000000149 | -3.01 | 9.06 | -27.271 |
| -3.000000000000149 | -3 | 9 | -27 |
| -2.990000000000149 | -2.99 | 8.94 | -26.731 |
| -2.98000000000015 | -2.98 | 8.88 | -26.464 |
| -2.97000000000015 | -2.97 | 8.821 | -26.198 |
| -2.96000000000015 | -2.96 | 8.762 | -25.934 |
| -2.95000000000015 | -2.95 | 8.703 | -25.672 |
| -2.94000000000015 | -2.94 | 8.644 | -25.412 |
| -2.930000000000151 | -2.93 | 8.585 | -25.154 |
| -2.920000000000151 | -2.92 | 8.526 | -24.897 |
| -2.910000000000151 | -2.91 | 8.468 | -24.642 |
| -2.900000000000151 | -2.9 | 8.41 | -24.389 |
| -2.890000000000151 | -2.89 | 8.352 | -24.138 |
| -2.880000000000152 | -2.88 | 8.294 | -23.888 |
| -2.870000000000152 | -2.87 | 8.237 | -23.64 |
| -2.860000000000152 | -2.86 | 8.18 | -23.394 |
| -2.850000000000152 | -2.85 | 8.123 | -23.149 |
| -2.840000000000153 | -2.84 | 8.066 | -22.906 |
| -2.830000000000153 | -2.83 | 8.009 | -22.665 |
| -2.820000000000153 | -2.82 | 7.952 | -22.426 |
| -2.810000000000153 | -2.81 | 7.896 | -22.188 |
| -2.800000000000153 | -2.8 | 7.84 | -21.952 |
| -2.790000000000154 | -2.79 | 7.784 | -21.718 |
| -2.780000000000154 | -2.78 | 7.728 | -21.485 |
| -2.770000000000154 | -2.77 | 7.673 | -21.254 |
| -2.760000000000154 | -2.76 | 7.618 | -21.025 |
| -2.750000000000154 | -2.75 | 7.563 | -20.797 |
| -2.740000000000155 | -2.74 | 7.508 | -20.571 |
| -2.730000000000155 | -2.73 | 7.453 | -20.346 |
| -2.720000000000155 | -2.72 | 7.398 | -20.124 |
| -2.710000000000155 | -2.71 | 7.344 | -19.903 |
| -2.700000000000156 | -2.7 | 7.29 | -19.683 |
| -2.690000000000156 | -2.69 | 7.236 | -19.465 |
| -2.680000000000156 | -2.68 | 7.182 | -19.249 |
| -2.670000000000156 | -2.67 | 7.129 | -19.034 |
| -2.660000000000156 | -2.66 | 7.076 | -18.821 |
| -2.650000000000157 | -2.65 | 7.023 | -18.61 |
| -2.640000000000157 | -2.64 | 6.97 | -18.4 |
| -2.630000000000157 | -2.63 | 6.917 | -18.191 |
| -2.620000000000157 | -2.62 | 6.864 | -17.985 |
| -2.610000000000157 | -2.61 | 6.812 | -17.78 |
| -2.600000000000158 | -2.6 | 6.76 | -17.576 |
| -2.590000000000158 | -2.59 | 6.708 | -17.374 |
| -2.580000000000158 | -2.58 | 6.656 | -17.174 |
| -2.570000000000158 | -2.57 | 6.605 | -16.975 |
| -2.560000000000159 | -2.56 | 6.554 | -16.777 |
| -2.550000000000159 | -2.55 | 6.503 | -16.581 |
| -2.54000000000016 | -2.54 | 6.452 | -16.387 |
| -2.530000000000159 | -2.53 | 6.401 | -16.194 |
| -2.520000000000159 | -2.52 | 6.35 | -16.003 |
| -2.51000000000016 | -2.51 | 6.3 | -15.813 |
| -2.50000000000016 | -2.5 | 6.25 | -15.625 |
| -2.49000000000016 | -2.49 | 6.2 | -15.438 |
| -2.48000000000016 | -2.48 | 6.15 | -15.253 |
| -2.47000000000016 | -2.47 | 6.101 | -15.069 |
| -2.460000000000161 | -2.46 | 6.052 | -14.887 |
| -2.450000000000161 | -2.45 | 6.003 | -14.706 |
| -2.440000000000161 | -2.44 | 5.954 | -14.527 |
| -2.430000000000161 | -2.43 | 5.905 | -14.349 |
| -2.420000000000162 | -2.42 | 5.856 | -14.172 |
| -2.410000000000162 | -2.41 | 5.808 | -13.998 |
| -2.400000000000162 | -2.4 | 5.76 | -13.824 |
| -2.390000000000162 | -2.39 | 5.712 | -13.652 |
| -2.380000000000162 | -2.38 | 5.664 | -13.481 |
| -2.370000000000163 | -2.37 | 5.617 | -13.312 |
| -2.360000000000163 | -2.36 | 5.57 | -13.144 |
| -2.350000000000163 | -2.35 | 5.523 | -12.978 |
| -2.340000000000163 | -2.34 | 5.476 | -12.813 |
| -2.330000000000163 | -2.33 | 5.429 | -12.649 |
| -2.320000000000164 | -2.32 | 5.382 | -12.487 |
| -2.310000000000164 | -2.31 | 5.336 | -12.326 |
| -2.300000000000164 | -2.3 | 5.29 | -12.167 |
| -2.290000000000164 | -2.29 | 5.244 | -12.009 |
| -2.280000000000165 | -2.28 | 5.198 | -11.852 |
| -2.270000000000165 | -2.27 | 5.153 | -11.697 |
| -2.260000000000165 | -2.26 | 5.108 | -11.543 |
| -2.250000000000165 | -2.25 | 5.063 | -11.391 |
| -2.240000000000165 | -2.24 | 5.018 | -11.239 |
| -2.230000000000166 | -2.23 | 4.973 | -11.09 |
| -2.220000000000166 | -2.22 | 4.928 | -10.941 |
| -2.210000000000166 | -2.21 | 4.884 | -10.794 |
| -2.200000000000166 | -2.2 | 4.84 | -10.648 |
| -2.190000000000166 | -2.19 | 4.796 | -10.503 |
| -2.180000000000167 | -2.18 | 4.752 | -10.36 |
| -2.170000000000167 | -2.17 | 4.709 | -10.218 |
| -2.160000000000167 | -2.16 | 4.666 | -10.078 |
| -2.150000000000167 | -2.15 | 4.623 | -9.938 |
| -2.140000000000168 | -2.14 | 4.58 | -9.8 |
| -2.130000000000168 | -2.13 | 4.537 | -9.664 |
| -2.120000000000168 | -2.12 | 4.494 | -9.528 |
| -2.110000000000168 | -2.11 | 4.452 | -9.394 |
| -2.100000000000168 | -2.1 | 4.41 | -9.261 |
| -2.090000000000169 | -2.09 | 4.368 | -9.129 |
| -2.080000000000169 | -2.08 | 4.326 | -8.999 |
| -2.070000000000169 | -2.07 | 4.285 | -8.87 |
| -2.060000000000169 | -2.06 | 4.244 | -8.742 |
| -2.050000000000169 | -2.05 | 4.203 | -8.615 |
| -2.04000000000017 | -2.04 | 4.162 | -8.49 |
| -2.03000000000017 | -2.03 | 4.121 | -8.365 |
| -2.02000000000017 | -2.02 | 4.08 | -8.242 |
| -2.01000000000017 | -2.01 | 4.04 | -8.121 |
| -2.000000000000171 | -2 | 4 | -8 |
| -1.99000000000017 | -1.99 | 3.96 | -7.881 |
| -1.98000000000017 | -1.98 | 3.92 | -7.762 |
| -1.97000000000017 | -1.97 | 3.881 | -7.645 |
| -1.96000000000017 | -1.96 | 3.842 | -7.53 |
| -1.95000000000017 | -1.95 | 3.803 | -7.415 |
| -1.94000000000017 | -1.94 | 3.764 | -7.301 |
| -1.93000000000017 | -1.93 | 3.725 | -7.189 |
| -1.92000000000017 | -1.92 | 3.686 | -7.078 |
| -1.91000000000017 | -1.91 | 3.648 | -6.968 |
| -1.90000000000017 | -1.9 | 3.61 | -6.859 |
| -1.89000000000017 | -1.89 | 3.572 | -6.751 |
| -1.88000000000017 | -1.88 | 3.534 | -6.645 |
| -1.87000000000017 | -1.87 | 3.497 | -6.539 |
| -1.86000000000017 | -1.86 | 3.46 | -6.435 |
| -1.85000000000017 | -1.85 | 3.423 | -6.332 |
| -1.84000000000017 | -1.84 | 3.386 | -6.23 |
| -1.83000000000017 | -1.83 | 3.349 | -6.128 |
| -1.82000000000017 | -1.82 | 3.312 | -6.029 |
| -1.81000000000017 | -1.81 | 3.276 | -5.93 |
| -1.80000000000017 | -1.8 | 3.24 | -5.832 |
| -1.79000000000017 | -1.79 | 3.204 | -5.735 |
| -1.78000000000017 | -1.78 | 3.168 | -5.64 |
| -1.77000000000017 | -1.77 | 3.133 | -5.545 |
| -1.76000000000017 | -1.76 | 3.098 | -5.452 |
| -1.75000000000017 | -1.75 | 3.063 | -5.359 |
| -1.74000000000017 | -1.74 | 3.028 | -5.268 |
| -1.73000000000017 | -1.73 | 2.993 | -5.178 |
| -1.72000000000017 | -1.72 | 2.958 | -5.088 |
| -1.71000000000017 | -1.71 | 2.924 | -5 |
| -1.70000000000017 | -1.7 | 2.89 | -4.913 |
| -1.69000000000017 | -1.69 | 2.856 | -4.827 |
| -1.68000000000017 | -1.68 | 2.822 | -4.742 |
| -1.67000000000017 | -1.67 | 2.789 | -4.657 |
| -1.66000000000017 | -1.66 | 2.756 | -4.574 |
| -1.65000000000017 | -1.65 | 2.723 | -4.492 |
| -1.64000000000017 | -1.64 | 2.69 | -4.411 |
| -1.63000000000017 | -1.63 | 2.657 | -4.331 |
| -1.62000000000017 | -1.62 | 2.624 | -4.252 |
| -1.61000000000017 | -1.61 | 2.592 | -4.173 |
| -1.60000000000017 | -1.6 | 2.56 | -4.096 |
| -1.59000000000017 | -1.59 | 2.528 | -4.02 |
| -1.58000000000017 | -1.58 | 2.496 | -3.944 |
| -1.57000000000017 | -1.57 | 2.465 | -3.87 |
| -1.56000000000017 | -1.56 | 2.434 | -3.796 |
| -1.55000000000017 | -1.55 | 2.403 | -3.724 |
| -1.54000000000017 | -1.54 | 2.372 | -3.652 |
| -1.53000000000017 | -1.53 | 2.341 | -3.582 |
| -1.52000000000017 | -1.52 | 2.31 | -3.512 |
| -1.51000000000017 | -1.51 | 2.28 | -3.443 |
| -1.50000000000017 | -1.5 | 2.25 | -3.375 |
| -1.49000000000017 | -1.49 | 2.22 | -3.308 |
| -1.48000000000017 | -1.48 | 2.19 | -3.242 |
| -1.47000000000017 | -1.47 | 2.161 | -3.177 |
| -1.46000000000017 | -1.46 | 2.132 | -3.112 |
| -1.45000000000017 | -1.45 | 2.103 | -3.049 |
| -1.44000000000017 | -1.44 | 2.074 | -2.986 |
| -1.43000000000017 | -1.43 | 2.045 | -2.924 |
| -1.42000000000017 | -1.42 | 2.016 | -2.863 |
| -1.41000000000017 | -1.41 | 1.988 | -2.803 |
| -1.40000000000017 | -1.4 | 1.96 | -2.744 |
| -1.39000000000017 | -1.39 | 1.932 | -2.686 |
| -1.38000000000017 | -1.38 | 1.904 | -2.628 |
| -1.37000000000017 | -1.37 | 1.877 | -2.571 |
| -1.36000000000017 | -1.36 | 1.85 | -2.515 |
| -1.35000000000017 | -1.35 | 1.823 | -2.46 |
| -1.34000000000017 | -1.34 | 1.796 | -2.406 |
| -1.33000000000017 | -1.33 | 1.769 | -2.353 |
| -1.32000000000017 | -1.32 | 1.742 | -2.3 |
| -1.31000000000017 | -1.31 | 1.716 | -2.248 |
| -1.30000000000017 | -1.3 | 1.69 | -2.197 |
| -1.29000000000017 | -1.29 | 1.664 | -2.147 |
| -1.28000000000017 | -1.28 | 1.638 | -2.097 |
| -1.27000000000017 | -1.27 | 1.613 | -2.048 |
| -1.26000000000017 | -1.26 | 1.588 | -2 |
| -1.25000000000017 | -1.25 | 1.563 | -1.953 |
| -1.24000000000017 | -1.24 | 1.538 | -1.907 |
| -1.23000000000017 | -1.23 | 1.513 | -1.861 |
| -1.22000000000017 | -1.22 | 1.488 | -1.816 |
| -1.21000000000017 | -1.21 | 1.464 | -1.772 |
| -1.20000000000017 | -1.2 | 1.44 | -1.728 |
| -1.19000000000017 | -1.19 | 1.416 | -1.685 |
| -1.18000000000017 | -1.18 | 1.392 | -1.643 |
| -1.17000000000017 | -1.17 | 1.369 | -1.602 |
| -1.16000000000017 | -1.16 | 1.346 | -1.561 |
| -1.15000000000017 | -1.15 | 1.323 | -1.521 |
| -1.14000000000017 | -1.14 | 1.3 | -1.482 |
| -1.13000000000017 | -1.13 | 1.277 | -1.443 |
| -1.12000000000017 | -1.12 | 1.254 | -1.405 |
| -1.11000000000017 | -1.11 | 1.232 | -1.368 |
| -1.10000000000017 | -1.1 | 1.21 | -1.331 |
| -1.09000000000017 | -1.09 | 1.188 | -1.295 |
| -1.08000000000017 | -1.08 | 1.166 | -1.26 |
| -1.07000000000017 | -1.07 | 1.145 | -1.225 |
| -1.06000000000017 | -1.06 | 1.124 | -1.191 |
| -1.05000000000017 | -1.05 | 1.103 | -1.158 |
| -1.04000000000017 | -1.04 | 1.082 | -1.125 |
| -1.03000000000017 | -1.03 | 1.061 | -1.093 |
| -1.02000000000017 | -1.02 | 1.04 | -1.061 |
| -1.01000000000017 | -1.01 | 1.02 | -1.03 |
| -1.00000000000017 | -1 | 1 | -1 |
| -0.99000000000017 | -0.99 | 0.98 | -0.97 |
| -0.98000000000017 | -0.98 | 0.96 | -0.941 |
| -0.97000000000017 | -0.97 | 0.941 | -0.913 |
| -0.96000000000017 | -0.96 | 0.922 | -0.885 |
| -0.95000000000017 | -0.95 | 0.903 | -0.857 |
| -0.94000000000017 | -0.94 | 0.884 | -0.831 |
| -0.93000000000017 | -0.93 | 0.865 | -0.804 |
| -0.92000000000017 | -0.92 | 0.846 | -0.779 |
| -0.91000000000017 | -0.91 | 0.828 | -0.754 |
| -0.90000000000017 | -0.9 | 0.81 | -0.729 |
| -0.890000000000169 | -0.89 | 0.792 | -0.705 |
| -0.880000000000169 | -0.88 | 0.774 | -0.681 |
| -0.870000000000169 | -0.87 | 0.757 | -0.659 |
| -0.860000000000169 | -0.86 | 0.74 | -0.636 |
| -0.850000000000169 | -0.85 | 0.723 | -0.614 |
| -0.840000000000169 | -0.84 | 0.706 | -0.593 |
| -0.830000000000169 | -0.83 | 0.689 | -0.572 |
| -0.820000000000169 | -0.82 | 0.672 | -0.551 |
| -0.810000000000169 | -0.81 | 0.656 | -0.531 |
| -0.800000000000169 | -0.8 | 0.64 | -0.512 |
| -0.790000000000169 | -0.79 | 0.624 | -0.493 |
| -0.780000000000169 | -0.78 | 0.608 | -0.475 |
| -0.770000000000169 | -0.77 | 0.593 | -0.457 |
| -0.760000000000169 | -0.76 | 0.578 | -0.439 |
| -0.750000000000169 | -0.75 | 0.563 | -0.422 |
| -0.740000000000169 | -0.74 | 0.548 | -0.405 |
| -0.730000000000169 | -0.73 | 0.533 | -0.389 |
| -0.720000000000169 | -0.72 | 0.518 | -0.373 |
| -0.710000000000169 | -0.71 | 0.504 | -0.358 |
| -0.700000000000169 | -0.7 | 0.49 | -0.343 |
| -0.690000000000169 | -0.69 | 0.476 | -0.329 |
| -0.680000000000169 | -0.68 | 0.462 | -0.314 |
| -0.670000000000169 | -0.67 | 0.449 | -0.301 |
| -0.660000000000169 | -0.66 | 0.436 | -0.287 |
| -0.650000000000169 | -0.65 | 0.423 | -0.275 |
| -0.640000000000169 | -0.64 | 0.41 | -0.262 |
| -0.630000000000169 | -0.63 | 0.397 | -0.25 |
| -0.620000000000169 | -0.62 | 0.384 | -0.238 |
| -0.610000000000169 | -0.61 | 0.372 | -0.227 |
| -0.600000000000169 | -0.6 | 0.36 | -0.216 |
| -0.590000000000169 | -0.59 | 0.348 | -0.205 |
| -0.580000000000169 | -0.58 | 0.336 | -0.195 |
| -0.570000000000169 | -0.57 | 0.325 | -0.185 |
| -0.560000000000169 | -0.56 | 0.314 | -0.176 |
| -0.550000000000169 | -0.55 | 0.303 | -0.166 |
| -0.540000000000169 | -0.54 | 0.292 | -0.157 |
| -0.530000000000169 | -0.53 | 0.281 | -0.149 |
| -0.520000000000169 | -0.52 | 0.27 | -0.141 |
| -0.510000000000169 | -0.51 | 0.26 | -0.133 |
| -0.500000000000169 | -0.5 | 0.25 | -0.125 |
| -0.490000000000169 | -0.49 | 0.24 | -0.118 |
| -0.480000000000169 | -0.48 | 0.23 | -0.111 |
| -0.470000000000169 | -0.47 | 0.221 | -0.104 |
| -0.460000000000169 | -0.46 | 0.212 | -0.097 |
| -0.450000000000169 | -0.45 | 0.203 | -0.091 |
| -0.440000000000169 | -0.44 | 0.194 | -0.085 |
| -0.430000000000169 | -0.43 | 0.185 | -0.08 |
| -0.420000000000169 | -0.42 | 0.176 | -0.074 |
| -0.410000000000169 | -0.41 | 0.168 | -0.069 |
| -0.400000000000169 | -0.4 | 0.16 | -0.064 |
| -0.390000000000169 | -0.39 | 0.152 | -0.059 |
| -0.380000000000169 | -0.38 | 0.144 | -0.055 |
| -0.370000000000169 | -0.37 | 0.137 | -0.051 |
| -0.360000000000169 | -0.36 | 0.13 | -0.047 |
| -0.350000000000169 | -0.35 | 0.123 | -0.043 |
| -0.340000000000169 | -0.34 | 0.116 | -0.039 |
| -0.330000000000169 | -0.33 | 0.109 | -0.036 |
| -0.320000000000169 | -0.32 | 0.102 | -0.033 |
| -0.310000000000169 | -0.31 | 0.096 | -0.03 |
| -0.300000000000169 | -0.3 | 0.09 | -0.027 |
| -0.290000000000169 | -0.29 | 0.084 | -0.024 |
| -0.280000000000169 | -0.28 | 0.078 | -0.022 |
| -0.270000000000169 | -0.27 | 0.073 | -0.02 |
| -0.260000000000169 | -0.26 | 0.068 | -0.018 |
| -0.250000000000169 | -0.25 | 0.063 | -0.016 |
| -0.240000000000169 | -0.24 | 0.058 | -0.014 |
| -0.230000000000169 | -0.23 | 0.053 | -0.012 |
| -0.220000000000169 | -0.22 | 0.048 | -0.011 |
| -0.210000000000169 | -0.21 | 0.044 | -0.009 |
| -0.200000000000169 | -0.2 | 0.04 | -0.008 |
| -0.190000000000169 | -0.19 | 0.036 | -0.007 |
| -0.180000000000169 | -0.18 | 0.032 | -0.006 |
| -0.170000000000169 | -0.17 | 0.029 | -0.005 |
| -0.160000000000169 | -0.16 | 0.026 | -0.004 |
| -0.150000000000169 | -0.15 | 0.023 | -0.003 |
| -0.140000000000169 | -0.14 | 0.02 | -0.003 |
| -0.130000000000169 | -0.13 | 0.017 | -0.002 |
| -0.120000000000169 | -0.12 | 0.014 | -0.002 |
| -0.110000000000169 | -0.11 | 0.012 | -0.001 |
| -0.100000000000169 | -0.1 | 0.01 | -0.001 |
| -0.0900000000001689 | -0.09 | 0.008 | -0.001 |
| -0.0800000000001689 | -0.08 | 0.006 | -0.001 |
| -0.0700000000001689 | -0.07 | 0.005 | 0 |
| -0.0600000000001689 | -0.06 | 0.004 | 0 |
| -0.0500000000001689 | -0.05 | 0.003 | 0 |
| -0.0400000000001689 | -0.04 | 0.002 | 0 |
| -0.0300000000001689 | -0.03 | 0.001 | 0 |
| -0.0200000000001689 | -0.02 | 0 | 0 |
| -0.0100000000001689 | -0.01 | 0 | 0 |
| -1.6888920817415e-13 | 0 | 0 | 0 |
| 0.00999999999983111 | 0.01 | 0 | 0 |
| 0.0199999999998311 | 0.02 | 0 | 0 |
| 0.0299999999998311 | 0.03 | 0.001 | 0 |
| 0.0399999999998311 | 0.04 | 0.002 | 0 |
| 0.0499999999998311 | 0.05 | 0.002 | 0 |
| 0.0599999999998311 | 0.06 | 0.004 | 0 |
| 0.0699999999998311 | 0.07 | 0.005 | 0 |
| 0.0799999999998311 | 0.08 | 0.006 | 0.001 |
| 0.0899999999998311 | 0.09 | 0.008 | 0.001 |
| 0.0999999999998311 | 0.1 | 0.01 | 0.001 |
| 0.109999999999831 | 0.11 | 0.012 | 0.001 |
| 0.119999999999831 | 0.12 | 0.014 | 0.002 |
| 0.129999999999831 | 0.13 | 0.017 | 0.002 |
| 0.139999999999831 | 0.14 | 0.02 | 0.003 |
| 0.149999999999831 | 0.15 | 0.022 | 0.003 |
| 0.159999999999831 | 0.16 | 0.026 | 0.004 |
| 0.169999999999831 | 0.17 | 0.029 | 0.005 |
| 0.179999999999831 | 0.18 | 0.032 | 0.006 |
| 0.189999999999831 | 0.19 | 0.036 | 0.007 |
| 0.199999999999831 | 0.2 | 0.04 | 0.008 |
| 0.209999999999831 | 0.21 | 0.044 | 0.009 |
| 0.219999999999831 | 0.22 | 0.048 | 0.011 |
| 0.229999999999831 | 0.23 | 0.053 | 0.012 |
| 0.239999999999831 | 0.24 | 0.058 | 0.014 |
| 0.249999999999831 | 0.25 | 0.062 | 0.016 |
| 0.259999999999831 | 0.26 | 0.068 | 0.018 |
| 0.269999999999831 | 0.27 | 0.073 | 0.02 |
| 0.279999999999831 | 0.28 | 0.078 | 0.022 |
| 0.289999999999831 | 0.29 | 0.084 | 0.024 |
| 0.299999999999831 | 0.3 | 0.09 | 0.027 |
| 0.309999999999831 | 0.31 | 0.096 | 0.03 |
| 0.319999999999831 | 0.32 | 0.102 | 0.033 |
| 0.329999999999831 | 0.33 | 0.109 | 0.036 |
| 0.339999999999831 | 0.34 | 0.116 | 0.039 |
| 0.349999999999831 | 0.35 | 0.122 | 0.043 |
| 0.359999999999831 | 0.36 | 0.13 | 0.047 |
| 0.369999999999831 | 0.37 | 0.137 | 0.051 |
| 0.379999999999831 | 0.38 | 0.144 | 0.055 |
| 0.389999999999831 | 0.39 | 0.152 | 0.059 |
| 0.399999999999831 | 0.4 | 0.16 | 0.064 |
| 0.409999999999831 | 0.41 | 0.168 | 0.069 |
| 0.419999999999831 | 0.42 | 0.176 | 0.074 |
| 0.429999999999831 | 0.43 | 0.185 | 0.08 |
| 0.439999999999831 | 0.44 | 0.194 | 0.085 |
| 0.449999999999831 | 0.45 | 0.202 | 0.091 |
| 0.459999999999831 | 0.46 | 0.212 | 0.097 |
| 0.469999999999831 | 0.47 | 0.221 | 0.104 |
| 0.479999999999831 | 0.48 | 0.23 | 0.111 |
| 0.489999999999831 | 0.49 | 0.24 | 0.118 |
| 0.499999999999831 | 0.5 | 0.25 | 0.125 |
| 0.509999999999831 | 0.51 | 0.26 | 0.133 |
| 0.519999999999831 | 0.52 | 0.27 | 0.141 |
| 0.529999999999831 | 0.53 | 0.281 | 0.149 |
| 0.539999999999831 | 0.54 | 0.292 | 0.157 |
| 0.549999999999831 | 0.55 | 0.302 | 0.166 |
| 0.559999999999831 | 0.56 | 0.314 | 0.176 |
| 0.569999999999831 | 0.57 | 0.325 | 0.185 |
| 0.579999999999831 | 0.58 | 0.336 | 0.195 |
| 0.589999999999831 | 0.59 | 0.348 | 0.205 |
| 0.599999999999831 | 0.6 | 0.36 | 0.216 |
| 0.609999999999831 | 0.61 | 0.372 | 0.227 |
| 0.619999999999831 | 0.62 | 0.384 | 0.238 |
| 0.629999999999831 | 0.63 | 0.397 | 0.25 |
| 0.639999999999831 | 0.64 | 0.41 | 0.262 |
| 0.649999999999831 | 0.65 | 0.422 | 0.275 |
| 0.659999999999831 | 0.66 | 0.436 | 0.287 |
| 0.669999999999831 | 0.67 | 0.449 | 0.301 |
| 0.679999999999831 | 0.68 | 0.462 | 0.314 |
| 0.689999999999831 | 0.69 | 0.476 | 0.329 |
| 0.699999999999831 | 0.7 | 0.49 | 0.343 |
| 0.709999999999831 | 0.71 | 0.504 | 0.358 |
| 0.719999999999831 | 0.72 | 0.518 | 0.373 |
| 0.729999999999831 | 0.73 | 0.533 | 0.389 |
| 0.739999999999831 | 0.74 | 0.548 | 0.405 |
| 0.749999999999832 | 0.75 | 0.562 | 0.422 |
| 0.759999999999832 | 0.76 | 0.578 | 0.439 |
| 0.769999999999832 | 0.77 | 0.593 | 0.457 |
| 0.779999999999832 | 0.78 | 0.608 | 0.475 |
| 0.789999999999832 | 0.79 | 0.624 | 0.493 |
| 0.799999999999832 | 0.8 | 0.64 | 0.512 |
| 0.809999999999832 | 0.81 | 0.656 | 0.531 |
| 0.819999999999832 | 0.82 | 0.672 | 0.551 |
| 0.829999999999832 | 0.83 | 0.689 | 0.572 |
| 0.839999999999832 | 0.84 | 0.706 | 0.593 |
| 0.849999999999832 | 0.85 | 0.722 | 0.614 |
| 0.859999999999832 | 0.86 | 0.74 | 0.636 |
| 0.869999999999832 | 0.87 | 0.757 | 0.659 |
| 0.879999999999832 | 0.88 | 0.774 | 0.681 |
| 0.889999999999832 | 0.89 | 0.792 | 0.705 |
| 0.899999999999832 | 0.9 | 0.81 | 0.729 |
| 0.909999999999832 | 0.91 | 0.828 | 0.754 |
| 0.919999999999832 | 0.92 | 0.846 | 0.779 |
| 0.929999999999832 | 0.93 | 0.865 | 0.804 |
| 0.939999999999832 | 0.94 | 0.884 | 0.831 |
| 0.949999999999832 | 0.95 | 0.902 | 0.857 |
| 0.959999999999832 | 0.96 | 0.922 | 0.885 |
| 0.969999999999832 | 0.97 | 0.941 | 0.913 |
| 0.979999999999832 | 0.98 | 0.96 | 0.941 |
| 0.989999999999832 | 0.99 | 0.98 | 0.97 |
| 0.999999999999832 | 1 | 1 | 1 |
| 1.009999999999832 | 1.01 | 1.02 | 1.03 |
| 1.019999999999832 | 1.02 | 1.04 | 1.061 |
| 1.029999999999832 | 1.03 | 1.061 | 1.093 |
| 1.039999999999832 | 1.04 | 1.082 | 1.125 |
| 1.049999999999832 | 1.05 | 1.102 | 1.158 |
| 1.059999999999832 | 1.06 | 1.124 | 1.191 |
| 1.069999999999832 | 1.07 | 1.145 | 1.225 |
| 1.079999999999832 | 1.08 | 1.166 | 1.26 |
| 1.089999999999832 | 1.09 | 1.188 | 1.295 |
| 1.099999999999832 | 1.1 | 1.21 | 1.331 |
| 1.109999999999832 | 1.11 | 1.232 | 1.368 |
| 1.119999999999832 | 1.12 | 1.254 | 1.405 |
| 1.129999999999832 | 1.13 | 1.277 | 1.443 |
| 1.139999999999832 | 1.14 | 1.3 | 1.482 |
| 1.149999999999832 | 1.15 | 1.322 | 1.521 |
| 1.159999999999832 | 1.16 | 1.346 | 1.561 |
| 1.169999999999832 | 1.17 | 1.369 | 1.602 |
| 1.179999999999832 | 1.18 | 1.392 | 1.643 |
| 1.189999999999832 | 1.19 | 1.416 | 1.685 |
| 1.199999999999832 | 1.2 | 1.44 | 1.728 |
| 1.209999999999832 | 1.21 | 1.464 | 1.772 |
| 1.219999999999832 | 1.22 | 1.488 | 1.816 |
| 1.229999999999832 | 1.23 | 1.513 | 1.861 |
| 1.239999999999832 | 1.24 | 1.538 | 1.907 |
| 1.249999999999832 | 1.25 | 1.562 | 1.953 |
| 1.259999999999832 | 1.26 | 1.588 | 2 |
| 1.269999999999832 | 1.27 | 1.613 | 2.048 |
| 1.279999999999832 | 1.28 | 1.638 | 2.097 |
| 1.289999999999832 | 1.29 | 1.664 | 2.147 |
| 1.299999999999832 | 1.3 | 1.69 | 2.197 |
| 1.309999999999832 | 1.31 | 1.716 | 2.248 |
| 1.319999999999832 | 1.32 | 1.742 | 2.3 |
| 1.329999999999832 | 1.33 | 1.769 | 2.353 |
| 1.339999999999832 | 1.34 | 1.796 | 2.406 |
| 1.349999999999832 | 1.35 | 1.822 | 2.46 |
| 1.359999999999832 | 1.36 | 1.85 | 2.515 |
| 1.369999999999832 | 1.37 | 1.877 | 2.571 |
| 1.379999999999832 | 1.38 | 1.904 | 2.628 |
| 1.389999999999832 | 1.39 | 1.932 | 2.686 |
| 1.399999999999832 | 1.4 | 1.96 | 2.744 |
| 1.409999999999832 | 1.41 | 1.988 | 2.803 |
| 1.419999999999832 | 1.42 | 2.016 | 2.863 |
| 1.429999999999832 | 1.43 | 2.045 | 2.924 |
| 1.439999999999832 | 1.44 | 2.074 | 2.986 |
| 1.449999999999832 | 1.45 | 2.102 | 3.049 |
| 1.459999999999832 | 1.46 | 2.132 | 3.112 |
| 1.469999999999832 | 1.47 | 2.161 | 3.177 |
| 1.479999999999832 | 1.48 | 2.19 | 3.242 |
| 1.489999999999832 | 1.49 | 2.22 | 3.308 |
| 1.499999999999832 | 1.5 | 2.25 | 3.375 |
| 1.509999999999832 | 1.51 | 2.28 | 3.443 |
| 1.519999999999832 | 1.52 | 2.31 | 3.512 |
| 1.529999999999832 | 1.53 | 2.341 | 3.582 |
| 1.539999999999832 | 1.54 | 2.372 | 3.652 |
| 1.549999999999832 | 1.55 | 2.402 | 3.724 |
| 1.559999999999832 | 1.56 | 2.434 | 3.796 |
| 1.569999999999832 | 1.57 | 2.465 | 3.87 |
| 1.579999999999832 | 1.58 | 2.496 | 3.944 |
| 1.589999999999832 | 1.59 | 2.528 | 4.02 |
| 1.599999999999832 | 1.6 | 2.56 | 4.096 |
| 1.609999999999832 | 1.61 | 2.592 | 4.173 |
| 1.619999999999832 | 1.62 | 2.624 | 4.252 |
| 1.629999999999832 | 1.63 | 2.657 | 4.331 |
| 1.639999999999832 | 1.64 | 2.69 | 4.411 |
| 1.649999999999832 | 1.65 | 2.722 | 4.492 |
| 1.659999999999832 | 1.66 | 2.756 | 4.574 |
| 1.669999999999832 | 1.67 | 2.789 | 4.657 |
| 1.679999999999832 | 1.68 | 2.822 | 4.742 |
| 1.689999999999832 | 1.69 | 2.856 | 4.827 |
| 1.699999999999832 | 1.7 | 2.89 | 4.913 |
| 1.709999999999832 | 1.71 | 2.924 | 5 |
| 1.719999999999832 | 1.72 | 2.958 | 5.088 |
| 1.729999999999832 | 1.73 | 2.993 | 5.178 |
| 1.739999999999832 | 1.74 | 3.028 | 5.268 |
| 1.749999999999832 | 1.75 | 3.062 | 5.359 |
| 1.759999999999832 | 1.76 | 3.098 | 5.452 |
| 1.769999999999832 | 1.77 | 3.133 | 5.545 |
| 1.779999999999832 | 1.78 | 3.168 | 5.64 |
| 1.789999999999832 | 1.79 | 3.204 | 5.735 |
| 1.799999999999832 | 1.8 | 3.24 | 5.832 |
| 1.809999999999832 | 1.81 | 3.276 | 5.93 |
| 1.819999999999832 | 1.82 | 3.312 | 6.029 |
| 1.829999999999832 | 1.83 | 3.349 | 6.128 |
| 1.839999999999832 | 1.84 | 3.386 | 6.23 |
| 1.849999999999832 | 1.85 | 3.422 | 6.332 |
| 1.859999999999832 | 1.86 | 3.46 | 6.435 |
| 1.869999999999832 | 1.87 | 3.497 | 6.539 |
| 1.879999999999832 | 1.88 | 3.534 | 6.645 |
| 1.889999999999832 | 1.89 | 3.572 | 6.751 |
| 1.899999999999832 | 1.9 | 3.61 | 6.859 |
| 1.909999999999832 | 1.91 | 3.648 | 6.968 |
| 1.919999999999832 | 1.92 | 3.686 | 7.078 |
| 1.929999999999832 | 1.93 | 3.725 | 7.189 |
| 1.939999999999832 | 1.94 | 3.764 | 7.301 |
| 1.949999999999833 | 1.95 | 3.802 | 7.415 |
| 1.959999999999833 | 1.96 | 3.842 | 7.53 |
| 1.969999999999833 | 1.97 | 3.881 | 7.645 |
| 1.979999999999833 | 1.98 | 3.92 | 7.762 |
| 1.989999999999833 | 1.99 | 3.96 | 7.881 |
| 1.999999999999833 | 2 | 4 | 8 |
| 2.009999999999832 | 2.01 | 4.04 | 8.121 |
| 2.019999999999832 | 2.02 | 4.08 | 8.242 |
| 2.029999999999832 | 2.03 | 4.121 | 8.365 |
| 2.039999999999832 | 2.04 | 4.162 | 8.49 |
| 2.049999999999832 | 2.05 | 4.202 | 8.615 |
| 2.059999999999831 | 2.06 | 4.244 | 8.742 |
| 2.069999999999831 | 2.07 | 4.285 | 8.87 |
| 2.079999999999831 | 2.08 | 4.326 | 8.999 |
| 2.089999999999831 | 2.09 | 4.368 | 9.129 |
| 2.09999999999983 | 2.1 | 4.41 | 9.261 |
| 2.10999999999983 | 2.11 | 4.452 | 9.394 |
| 2.11999999999983 | 2.12 | 4.494 | 9.528 |
| 2.12999999999983 | 2.13 | 4.537 | 9.664 |
| 2.13999999999983 | 2.14 | 4.58 | 9.8 |
| 2.149999999999829 | 2.15 | 4.622 | 9.938 |
| 2.159999999999829 | 2.16 | 4.666 | 10.078 |
| 2.169999999999829 | 2.17 | 4.709 | 10.218 |
| 2.179999999999829 | 2.18 | 4.752 | 10.36 |
| 2.189999999999829 | 2.19 | 4.796 | 10.503 |
| 2.199999999999828 | 2.2 | 4.84 | 10.648 |
| 2.209999999999828 | 2.21 | 4.884 | 10.794 |
| 2.219999999999828 | 2.22 | 4.928 | 10.941 |
| 2.229999999999828 | 2.23 | 4.973 | 11.09 |
| 2.239999999999827 | 2.24 | 5.018 | 11.239 |
| 2.249999999999827 | 2.25 | 5.062 | 11.391 |
| 2.259999999999827 | 2.26 | 5.108 | 11.543 |
| 2.269999999999827 | 2.27 | 5.153 | 11.697 |
| 2.279999999999827 | 2.28 | 5.198 | 11.852 |
| 2.289999999999826 | 2.29 | 5.244 | 12.009 |
| 2.299999999999826 | 2.3 | 5.29 | 12.167 |
| 2.309999999999826 | 2.31 | 5.336 | 12.326 |
| 2.319999999999826 | 2.32 | 5.382 | 12.487 |
| 2.329999999999825 | 2.33 | 5.429 | 12.649 |
| 2.339999999999825 | 2.34 | 5.476 | 12.813 |
| 2.349999999999825 | 2.35 | 5.522 | 12.978 |
| 2.359999999999825 | 2.36 | 5.57 | 13.144 |
| 2.369999999999825 | 2.37 | 5.617 | 13.312 |
| 2.379999999999824 | 2.38 | 5.664 | 13.481 |
| 2.389999999999824 | 2.39 | 5.712 | 13.652 |
| 2.399999999999824 | 2.4 | 5.76 | 13.824 |
| 2.409999999999824 | 2.41 | 5.808 | 13.998 |
| 2.419999999999824 | 2.42 | 5.856 | 14.172 |
| 2.429999999999823 | 2.43 | 5.905 | 14.349 |
| 2.439999999999823 | 2.44 | 5.954 | 14.527 |
| 2.449999999999823 | 2.45 | 6.002 | 14.706 |
| 2.459999999999823 | 2.46 | 6.052 | 14.887 |
| 2.469999999999823 | 2.47 | 6.101 | 15.069 |
| 2.479999999999822 | 2.48 | 6.15 | 15.253 |
| 2.489999999999822 | 2.49 | 6.2 | 15.438 |
| 2.499999999999822 | 2.5 | 6.25 | 15.625 |
| 2.509999999999822 | 2.51 | 6.3 | 15.813 |
| 2.519999999999821 | 2.52 | 6.35 | 16.003 |
| 2.529999999999821 | 2.53 | 6.401 | 16.194 |
| 2.539999999999821 | 2.54 | 6.452 | 16.387 |
| 2.549999999999821 | 2.55 | 6.502 | 16.581 |
| 2.559999999999821 | 2.56 | 6.554 | 16.777 |
| 2.56999999999982 | 2.57 | 6.605 | 16.975 |
| 2.57999999999982 | 2.58 | 6.656 | 17.174 |
| 2.58999999999982 | 2.59 | 6.708 | 17.374 |
| 2.59999999999982 | 2.6 | 6.76 | 17.576 |
| 2.609999999999819 | 2.61 | 6.812 | 17.78 |
| 2.619999999999819 | 2.62 | 6.864 | 17.985 |
| 2.629999999999819 | 2.63 | 6.917 | 18.191 |
| 2.639999999999819 | 2.64 | 6.97 | 18.4 |
| 2.649999999999819 | 2.65 | 7.022 | 18.61 |
| 2.659999999999818 | 2.66 | 7.076 | 18.821 |
| 2.669999999999818 | 2.67 | 7.129 | 19.034 |
| 2.679999999999818 | 2.68 | 7.182 | 19.249 |
| 2.689999999999818 | 2.69 | 7.236 | 19.465 |
| 2.699999999999818 | 2.7 | 7.29 | 19.683 |
| 2.709999999999817 | 2.71 | 7.344 | 19.903 |
| 2.719999999999817 | 2.72 | 7.398 | 20.124 |
| 2.729999999999817 | 2.73 | 7.453 | 20.346 |
| 2.739999999999817 | 2.74 | 7.508 | 20.571 |
| 2.749999999999817 | 2.75 | 7.562 | 20.797 |
| 2.759999999999816 | 2.76 | 7.618 | 21.025 |
| 2.769999999999816 | 2.77 | 7.673 | 21.254 |
| 2.779999999999816 | 2.78 | 7.728 | 21.485 |
| 2.789999999999816 | 2.79 | 7.784 | 21.718 |
| 2.799999999999815 | 2.8 | 7.84 | 21.952 |
| 2.809999999999815 | 2.81 | 7.896 | 22.188 |
| 2.819999999999815 | 2.82 | 7.952 | 22.426 |
| 2.829999999999815 | 2.83 | 8.009 | 22.665 |
| 2.839999999999815 | 2.84 | 8.066 | 22.906 |
| 2.849999999999814 | 2.85 | 8.122 | 23.149 |
| 2.859999999999814 | 2.86 | 8.18 | 23.394 |
| 2.869999999999814 | 2.87 | 8.237 | 23.64 |
| 2.879999999999814 | 2.88 | 8.294 | 23.888 |
| 2.889999999999814 | 2.89 | 8.352 | 24.138 |
| 2.899999999999813 | 2.9 | 8.41 | 24.389 |
| 2.909999999999813 | 2.91 | 8.468 | 24.642 |
| 2.919999999999813 | 2.92 | 8.526 | 24.897 |
| 2.929999999999813 | 2.93 | 8.585 | 25.154 |
| 2.939999999999813 | 2.94 | 8.644 | 25.412 |
| 2.949999999999812 | 2.95 | 8.702 | 25.672 |
| 2.959999999999812 | 2.96 | 8.762 | 25.934 |
| 2.969999999999812 | 2.97 | 8.821 | 26.198 |
| 2.979999999999812 | 2.98 | 8.88 | 26.464 |
| 2.989999999999811 | 2.99 | 8.94 | 26.731 |
| 2.999999999999811 | 3 | 9 | 27 |
| 3.009999999999811 | 3.01 | 9.06 | 27.271 |
| 3.019999999999811 | 3.02 | 9.12 | 27.544 |
| 3.029999999999811 | 3.03 | 9.181 | 27.818 |
| 3.03999999999981 | 3.04 | 9.242 | 28.094 |
| 3.04999999999981 | 3.05 | 9.302 | 28.373 |
| 3.05999999999981 | 3.06 | 9.364 | 28.653 |
| 3.06999999999981 | 3.07 | 9.425 | 28.934 |
| 3.07999999999981 | 3.08 | 9.486 | 29.218 |
| 3.089999999999809 | 3.09 | 9.548 | 29.504 |
| 3.099999999999809 | 3.1 | 9.61 | 29.791 |
| 3.109999999999809 | 3.11 | 9.672 | 30.08 |
| 3.119999999999809 | 3.12 | 9.734 | 30.371 |
| 3.129999999999808 | 3.13 | 9.797 | 30.664 |
| 3.139999999999808 | 3.14 | 9.86 | 30.959 |
| 3.149999999999808 | 3.15 | 9.922 | 31.256 |
| 3.159999999999808 | 3.16 | 9.986 | 31.554 |
| 3.169999999999808 | 3.17 | 10.049 | 31.855 |
| 3.179999999999807 | 3.18 | 10.112 | 32.157 |
| 3.189999999999807 | 3.19 | 10.176 | 32.462 |
| 3.199999999999807 | 3.2 | 10.24 | 32.768 |
| 3.209999999999807 | 3.21 | 10.304 | 33.076 |
| 3.219999999999807 | 3.22 | 10.368 | 33.386 |
| 3.229999999999806 | 3.23 | 10.433 | 33.698 |
| 3.239999999999806 | 3.24 | 10.498 | 34.012 |
| 3.249999999999806 | 3.25 | 10.562 | 34.328 |
| 3.259999999999806 | 3.26 | 10.628 | 34.646 |
| 3.269999999999805 | 3.27 | 10.693 | 34.966 |
| 3.279999999999805 | 3.28 | 10.758 | 35.288 |
| 3.289999999999805 | 3.29 | 10.824 | 35.611 |
| 3.299999999999805 | 3.3 | 10.89 | 35.937 |
| 3.309999999999805 | 3.31 | 10.956 | 36.265 |
| 3.319999999999804 | 3.32 | 11.022 | 36.594 |
| 3.329999999999804 | 3.33 | 11.089 | 36.926 |
| 3.339999999999804 | 3.34 | 11.156 | 37.26 |
| 3.349999999999804 | 3.35 | 11.222 | 37.595 |
| 3.359999999999804 | 3.36 | 11.29 | 37.933 |
| 3.369999999999803 | 3.37 | 11.357 | 38.273 |
| 3.379999999999803 | 3.38 | 11.424 | 38.614 |
| 3.389999999999803 | 3.39 | 11.492 | 38.958 |
| 3.399999999999803 | 3.4 | 11.56 | 39.304 |
| 3.409999999999802 | 3.41 | 11.628 | 39.652 |
| 3.419999999999802 | 3.42 | 11.696 | 40.002 |
| 3.429999999999802 | 3.43 | 11.765 | 40.354 |
| 3.439999999999802 | 3.44 | 11.834 | 40.708 |
| 3.449999999999802 | 3.45 | 11.902 | 41.064 |
| 3.459999999999801 | 3.46 | 11.972 | 41.422 |
| 3.469999999999801 | 3.47 | 12.041 | 41.782 |
| 3.479999999999801 | 3.48 | 12.11 | 42.144 |
| 3.489999999999801 | 3.49 | 12.18 | 42.509 |
| 3.499999999999801 | 3.5 | 12.25 | 42.875 |
| 3.5099999999998 | 3.51 | 12.32 | 43.244 |
| 3.5199999999998 | 3.52 | 12.39 | 43.614 |
| 3.5299999999998 | 3.53 | 12.461 | 43.987 |
| 3.5399999999998 | 3.54 | 12.532 | 44.362 |
| 3.5499999999998 | 3.55 | 12.602 | 44.739 |
| 3.559999999999799 | 3.56 | 12.674 | 45.118 |
| 3.569999999999799 | 3.57 | 12.745 | 45.499 |
| 3.579999999999799 | 3.58 | 12.816 | 45.883 |
| 3.589999999999799 | 3.59 | 12.888 | 46.268 |
| 3.599999999999798 | 3.6 | 12.96 | 46.656 |
| 3.609999999999798 | 3.61 | 13.032 | 47.046 |
| 3.619999999999798 | 3.62 | 13.104 | 47.438 |
| 3.629999999999798 | 3.63 | 13.177 | 47.832 |
| 3.639999999999798 | 3.64 | 13.25 | 48.229 |
| 3.649999999999797 | 3.65 | 13.322 | 48.627 |
| 3.659999999999797 | 3.66 | 13.396 | 49.028 |
| 3.669999999999797 | 3.67 | 13.469 | 49.431 |
| 3.679999999999797 | 3.68 | 13.542 | 49.836 |
| 3.689999999999796 | 3.69 | 13.616 | 50.243 |
| 3.699999999999796 | 3.7 | 13.69 | 50.653 |
| 3.709999999999796 | 3.71 | 13.764 | 51.065 |
| 3.719999999999796 | 3.72 | 13.838 | 51.479 |
| 3.729999999999796 | 3.73 | 13.913 | 51.895 |
| 3.739999999999795 | 3.74 | 13.988 | 52.314 |
| 3.749999999999795 | 3.75 | 14.062 | 52.734 |
| 3.759999999999795 | 3.76 | 14.138 | 53.157 |
| 3.769999999999795 | 3.77 | 14.213 | 53.583 |
| 3.779999999999795 | 3.78 | 14.288 | 54.01 |
| 3.789999999999794 | 3.79 | 14.364 | 54.44 |
| 3.799999999999794 | 3.8 | 14.44 | 54.872 |
| 3.809999999999794 | 3.81 | 14.516 | 55.306 |
| 3.819999999999794 | 3.82 | 14.592 | 55.743 |
| 3.829999999999794 | 3.83 | 14.669 | 56.182 |
| 3.839999999999793 | 3.84 | 14.746 | 56.623 |
| 3.849999999999793 | 3.85 | 14.822 | 57.067 |
| 3.859999999999793 | 3.86 | 14.9 | 57.512 |
| 3.869999999999793 | 3.87 | 14.977 | 57.961 |
| 3.879999999999792 | 3.88 | 15.054 | 58.411 |
| 3.889999999999792 | 3.89 | 15.132 | 58.864 |
| 3.899999999999792 | 3.9 | 15.21 | 59.319 |
| 3.909999999999792 | 3.91 | 15.288 | 59.776 |
| 3.919999999999792 | 3.92 | 15.366 | 60.236 |
| 3.929999999999791 | 3.93 | 15.445 | 60.698 |
| 3.939999999999791 | 3.94 | 15.524 | 61.163 |
| 3.949999999999791 | 3.95 | 15.602 | 61.63 |
| 3.959999999999791 | 3.96 | 15.682 | 62.099 |
| 3.969999999999791 | 3.97 | 15.761 | 62.571 |
| 3.97999999999979 | 3.98 | 15.84 | 63.045 |
| 3.98999999999979 | 3.99 | 15.92 | 63.521 |
| 3.99999999999979 | 4 | 16 | 64 |
| 4.00999999999979 | 4.01 | 16.08 | 64.481 |
| 4.01999999999979 | 4.02 | 16.16 | 64.965 |
| 4.02999999999979 | 4.03 | 16.241 | 65.451 |
| 4.03999999999979 | 4.04 | 16.322 | 65.939 |
| 4.04999999999979 | 4.05 | 16.402 | 66.43 |
| 4.05999999999979 | 4.06 | 16.484 | 66.923 |
| 4.069999999999789 | 4.07 | 16.565 | 67.419 |
| 4.079999999999788 | 4.08 | 16.646 | 67.917 |
| 4.089999999999788 | 4.09 | 16.728 | 68.418 |
| 4.099999999999788 | 4.1 | 16.81 | 68.921 |
| 4.109999999999788 | 4.11 | 16.892 | 69.427 |
| 4.119999999999788 | 4.12 | 16.974 | 69.935 |
| 4.129999999999788 | 4.13 | 17.057 | 70.445 |
| 4.139999999999787 | 4.14 | 17.14 | 70.958 |
| 4.149999999999787 | 4.15 | 17.222 | 71.473 |
| 4.159999999999787 | 4.16 | 17.306 | 71.991 |
| 4.169999999999787 | 4.17 | 17.389 | 72.512 |
| 4.179999999999786 | 4.18 | 17.472 | 73.035 |
| 4.189999999999786 | 4.19 | 17.556 | 73.56 |
| 4.199999999999786 | 4.2 | 17.64 | 74.088 |
| 4.209999999999785 | 4.21 | 17.724 | 74.618 |
| 4.219999999999785 | 4.22 | 17.808 | 75.151 |
| 4.229999999999785 | 4.23 | 17.893 | 75.687 |
| 4.239999999999785 | 4.24 | 17.978 | 76.225 |
| 4.249999999999785 | 4.25 | 18.062 | 76.766 |
| 4.259999999999784 | 4.26 | 18.148 | 77.309 |
| 4.269999999999784 | 4.27 | 18.233 | 77.854 |
| 4.279999999999784 | 4.28 | 18.318 | 78.403 |
| 4.289999999999784 | 4.29 | 18.404 | 78.954 |
| 4.299999999999784 | 4.3 | 18.49 | 79.507 |
| 4.309999999999784 | 4.31 | 18.576 | 80.063 |
| 4.319999999999784 | 4.32 | 18.662 | 80.622 |
| 4.329999999999783 | 4.33 | 18.749 | 81.183 |
| 4.339999999999783 | 4.34 | 18.836 | 81.747 |
| 4.349999999999783 | 4.35 | 18.922 | 82.313 |
| 4.359999999999783 | 4.36 | 19.01 | 82.882 |
| 4.369999999999782 | 4.37 | 19.097 | 83.453 |
| 4.379999999999782 | 4.38 | 19.184 | 84.028 |
| 4.389999999999782 | 4.39 | 19.272 | 84.605 |
| 4.399999999999782 | 4.4 | 19.36 | 85.184 |
| 4.409999999999781 | 4.41 | 19.448 | 85.766 |
| 4.419999999999781 | 4.42 | 19.536 | 86.351 |
| 4.429999999999781 | 4.43 | 19.625 | 86.938 |
| 4.43999999999978 | 4.44 | 19.714 | 87.528 |
| 4.44999999999978 | 4.45 | 19.802 | 88.121 |
| 4.45999999999978 | 4.46 | 19.892 | 88.717 |
| 4.46999999999978 | 4.47 | 19.981 | 89.315 |
| 4.47999999999978 | 4.48 | 20.07 | 89.915 |
| 4.48999999999978 | 4.49 | 20.16 | 90.519 |
| 4.49999999999978 | 4.5 | 20.25 | 91.125 |
| 4.50999999999978 | 4.51 | 20.34 | 91.734 |
| 4.51999999999978 | 4.52 | 20.43 | 92.345 |
| 4.52999999999978 | 4.53 | 20.521 | 92.96 |
| 4.539999999999778 | 4.54 | 20.612 | 93.577 |
| 4.549999999999778 | 4.55 | 20.702 | 94.196 |
| 4.559999999999778 | 4.56 | 20.794 | 94.819 |
| 4.569999999999778 | 4.57 | 20.885 | 95.444 |
| 4.579999999999778 | 4.58 | 20.976 | 96.072 |
| 4.589999999999777 | 4.59 | 21.068 | 96.703 |
| 4.599999999999777 | 4.6 | 21.16 | 97.336 |
| 4.609999999999777 | 4.61 | 21.252 | 97.972 |
| 4.619999999999777 | 4.62 | 21.344 | 98.611 |
| 4.629999999999777 | 4.63 | 21.437 | 99.253 |
| 4.639999999999776 | 4.64 | 21.53 | 99.897 |
| 4.649999999999776 | 4.65 | 21.622 | 100.545 |
| 4.659999999999776 | 4.66 | 21.716 | 101.195 |
| 4.669999999999776 | 4.67 | 21.809 | 101.848 |
| 4.679999999999775 | 4.68 | 21.902 | 102.503 |
| 4.689999999999775 | 4.69 | 21.996 | 103.162 |
| 4.699999999999775 | 4.7 | 22.09 | 103.823 |
| 4.709999999999775 | 4.71 | 22.184 | 104.487 |
| 4.719999999999774 | 4.72 | 22.278 | 105.154 |
| 4.729999999999774 | 4.73 | 22.373 | 105.824 |
| 4.739999999999774 | 4.74 | 22.468 | 106.496 |
| 4.749999999999774 | 4.75 | 22.562 | 107.172 |
| 4.759999999999774 | 4.76 | 22.658 | 107.85 |
| 4.769999999999774 | 4.77 | 22.753 | 108.531 |
| 4.779999999999773 | 4.78 | 22.848 | 109.215 |
| 4.789999999999773 | 4.79 | 22.944 | 109.902 |
| 4.799999999999773 | 4.8 | 23.04 | 110.592 |
| 4.809999999999773 | 4.81 | 23.136 | 111.285 |
| 4.819999999999773 | 4.82 | 23.232 | 111.98 |
| 4.829999999999773 | 4.83 | 23.329 | 112.679 |
| 4.839999999999772 | 4.84 | 23.426 | 113.38 |
| 4.849999999999772 | 4.85 | 23.522 | 114.084 |
| 4.859999999999772 | 4.86 | 23.62 | 114.791 |
| 4.869999999999772 | 4.87 | 23.717 | 115.501 |
| 4.879999999999771 | 4.88 | 23.814 | 116.214 |
| 4.889999999999771 | 4.89 | 23.912 | 116.93 |
| 4.899999999999771 | 4.9 | 24.01 | 117.649 |
| 4.90999999999977 | 4.91 | 24.108 | 118.371 |
| 4.91999999999977 | 4.92 | 24.206 | 119.095 |
| 4.92999999999977 | 4.93 | 24.305 | 119.823 |
| 4.93999999999977 | 4.94 | 24.404 | 120.554 |
| 4.94999999999977 | 4.95 | 24.502 | 121.287 |
| 4.95999999999977 | 4.96 | 24.602 | 122.024 |
| 4.96999999999977 | 4.97 | 24.701 | 122.763 |
| 4.97999999999977 | 4.98 | 24.8 | 123.506 |
| 4.98999999999977 | 4.99 | 24.9 | 124.251 |
| 4.99999999999977 | 5 | 25 | 125 |
| 5.009999999999768 | 5.01 | 25.1 | 125.752 |
| 5.019999999999768 | 5.02 | 25.2 | 126.506 |
| 5.029999999999768 | 5.03 | 25.301 | 127.264 |
| 5.039999999999768 | 5.04 | 25.402 | 128.024 |
| 5.049999999999767 | 5.05 | 25.502 | 128.788 |
| 5.059999999999767 | 5.06 | 25.604 | 129.554 |
| 5.069999999999767 | 5.07 | 25.705 | 130.324 |
| 5.079999999999767 | 5.08 | 25.806 | 131.097 |
| 5.089999999999767 | 5.09 | 25.908 | 131.872 |
| 5.099999999999766 | 5.1 | 26.01 | 132.651 |
| 5.109999999999766 | 5.11 | 26.112 | 133.433 |
| 5.119999999999766 | 5.12 | 26.214 | 134.218 |
| 5.129999999999766 | 5.13 | 26.317 | 135.006 |
| 5.139999999999766 | 5.14 | 26.42 | 135.797 |
| 5.149999999999765 | 5.15 | 26.522 | 136.591 |
| 5.159999999999765 | 5.16 | 26.626 | 137.388 |
| 5.169999999999765 | 5.17 | 26.729 | 138.188 |
| 5.179999999999765 | 5.18 | 26.832 | 138.992 |
| 5.189999999999764 | 5.19 | 26.936 | 139.798 |
| 5.199999999999764 | 5.2 | 27.04 | 140.608 |
| 5.209999999999764 | 5.21 | 27.144 | 141.421 |
| 5.219999999999764 | 5.22 | 27.248 | 142.237 |
| 5.229999999999764 | 5.23 | 27.353 | 143.056 |
| 5.239999999999763 | 5.24 | 27.458 | 143.878 |
| 5.249999999999763 | 5.25 | 27.562 | 144.703 |
| 5.259999999999763 | 5.26 | 27.668 | 145.532 |
| 5.269999999999763 | 5.27 | 27.773 | 146.363 |
| 5.279999999999763 | 5.28 | 27.878 | 147.198 |
| 5.289999999999762 | 5.29 | 27.984 | 148.036 |
| 5.299999999999762 | 5.3 | 28.09 | 148.877 |
| 5.309999999999762 | 5.31 | 28.196 | 149.721 |
| 5.319999999999762 | 5.32 | 28.302 | 150.569 |
| 5.329999999999762 | 5.33 | 28.409 | 151.419 |
| 5.339999999999761 | 5.34 | 28.516 | 152.273 |
| 5.349999999999761 | 5.35 | 28.622 | 153.13 |
| 5.359999999999761 | 5.36 | 28.73 | 153.991 |
| 5.369999999999761 | 5.37 | 28.837 | 154.854 |
| 5.37999999999976 | 5.38 | 28.944 | 155.721 |
| 5.38999999999976 | 5.39 | 29.052 | 156.591 |
| 5.39999999999976 | 5.4 | 29.16 | 157.464 |
| 5.40999999999976 | 5.41 | 29.268 | 158.34 |
| 5.41999999999976 | 5.42 | 29.376 | 159.22 |
| 5.42999999999976 | 5.43 | 29.485 | 160.103 |
| 5.43999999999976 | 5.44 | 29.594 | 160.989 |
| 5.44999999999976 | 5.45 | 29.702 | 161.879 |
| 5.45999999999976 | 5.46 | 29.812 | 162.771 |
| 5.46999999999976 | 5.47 | 29.921 | 163.667 |
| 5.479999999999758 | 5.48 | 30.03 | 164.567 |
| 5.489999999999758 | 5.49 | 30.14 | 165.469 |
| 5.499999999999758 | 5.5 | 30.25 | 166.375 |
| 5.509999999999758 | 5.51 | 30.36 | 167.284 |
| 5.519999999999758 | 5.52 | 30.47 | 168.197 |
| 5.529999999999758 | 5.53 | 30.581 | 169.112 |
| 5.539999999999757 | 5.54 | 30.692 | 170.031 |
| 5.549999999999757 | 5.55 | 30.802 | 170.954 |
| 5.559999999999757 | 5.56 | 30.914 | 171.88 |
| 5.569999999999757 | 5.57 | 31.025 | 172.809 |
| 5.579999999999756 | 5.58 | 31.136 | 173.741 |
| 5.589999999999756 | 5.59 | 31.248 | 174.677 |
| 5.599999999999756 | 5.6 | 31.36 | 175.616 |
| 5.609999999999756 | 5.61 | 31.472 | 176.558 |
| 5.619999999999756 | 5.62 | 31.584 | 177.504 |
| 5.629999999999756 | 5.63 | 31.697 | 178.454 |
| 5.639999999999755 | 5.64 | 31.81 | 179.406 |
| 5.649999999999755 | 5.65 | 31.922 | 180.362 |
| 5.659999999999755 | 5.66 | 32.036 | 181.321 |
| 5.669999999999755 | 5.67 | 32.149 | 182.284 |
| 5.679999999999754 | 5.68 | 32.262 | 183.25 |
| 5.689999999999754 | 5.69 | 32.376 | 184.22 |
| 5.699999999999754 | 5.7 | 32.49 | 185.193 |
| 5.709999999999754 | 5.71 | 32.604 | 186.169 |
| 5.719999999999754 | 5.72 | 32.718 | 187.149 |
| 5.729999999999753 | 5.73 | 32.833 | 188.133 |
| 5.739999999999753 | 5.74 | 32.948 | 189.119 |
| 5.749999999999753 | 5.75 | 33.062 | 190.109 |
| 5.759999999999753 | 5.76 | 33.178 | 191.103 |
| 5.769999999999753 | 5.77 | 33.293 | 192.1 |
| 5.779999999999752 | 5.78 | 33.408 | 193.101 |
| 5.789999999999752 | 5.79 | 33.524 | 194.105 |
| 5.799999999999752 | 5.8 | 33.64 | 195.112 |
| 5.809999999999752 | 5.81 | 33.756 | 196.123 |
| 5.819999999999752 | 5.82 | 33.872 | 197.137 |
| 5.829999999999751 | 5.83 | 33.989 | 198.155 |
| 5.839999999999751 | 5.84 | 34.106 | 199.177 |
| 5.849999999999751 | 5.85 | 34.222 | 200.202 |
| 5.859999999999751 | 5.86 | 34.34 | 201.23 |
| 5.86999999999975 | 5.87 | 34.457 | 202.262 |
| 5.87999999999975 | 5.88 | 34.574 | 203.297 |
| 5.88999999999975 | 5.89 | 34.692 | 204.336 |
| 5.89999999999975 | 5.9 | 34.81 | 205.379 |
| 5.90999999999975 | 5.91 | 34.928 | 206.425 |
| 5.91999999999975 | 5.92 | 35.046 | 207.475 |
| 5.92999999999975 | 5.93 | 35.165 | 208.528 |
| 5.93999999999975 | 5.94 | 35.284 | 209.585 |
| 5.949999999999748 | 5.95 | 35.402 | 210.645 |
| 5.959999999999748 | 5.96 | 35.522 | 211.709 |
| 5.969999999999748 | 5.97 | 35.641 | 212.776 |
| 5.979999999999748 | 5.98 | 35.76 | 213.847 |
| 5.989999999999747 | 5.99 | 35.88 | 214.922 |
| 5.999999999999747 | 6 | 36 | 216 |
| 6.009999999999747 | 6.01 | 36.12 | 217.082 |
| 6.019999999999747 | 6.02 | 36.24 | 218.167 |
| 6.029999999999747 | 6.03 | 36.361 | 219.256 |
| 6.039999999999746 | 6.04 | 36.482 | 220.349 |
| 6.049999999999746 | 6.05 | 36.602 | 221.445 |
| 6.059999999999746 | 6.06 | 36.724 | 222.545 |
| 6.069999999999746 | 6.07 | 36.845 | 223.649 |
| 6.079999999999746 | 6.08 | 36.966 | 224.756 |
| 6.089999999999745 | 6.09 | 37.088 | 225.867 |
| 6.099999999999745 | 6.1 | 37.21 | 226.981 |
| 6.109999999999745 | 6.11 | 37.332 | 228.099 |
| 6.119999999999745 | 6.12 | 37.454 | 229.221 |
| 6.129999999999745 | 6.13 | 37.577 | 230.346 |
| 6.139999999999744 | 6.14 | 37.7 | 231.476 |
| 6.149999999999744 | 6.15 | 37.822 | 232.608 |
| 6.159999999999744 | 6.16 | 37.946 | 233.745 |
| 6.169999999999744 | 6.17 | 38.069 | 234.885 |
| 6.179999999999744 | 6.18 | 38.192 | 236.029 |
| 6.189999999999744 | 6.19 | 38.316 | 237.177 |
| 6.199999999999743 | 6.2 | 38.44 | 238.328 |
| 6.209999999999743 | 6.21 | 38.564 | 239.483 |
| 6.219999999999743 | 6.22 | 38.688 | 240.642 |
| 6.229999999999743 | 6.23 | 38.813 | 241.804 |
| 6.239999999999742 | 6.24 | 38.938 | 242.971 |
| 6.249999999999742 | 6.25 | 39.062 | 244.141 |
| 6.259999999999742 | 6.26 | 39.188 | 245.314 |
| 6.269999999999742 | 6.27 | 39.313 | 246.492 |
| 6.279999999999741 | 6.28 | 39.438 | 247.673 |
| 6.289999999999741 | 6.29 | 39.564 | 248.858 |
| 6.299999999999741 | 6.3 | 39.69 | 250.047 |
| 6.309999999999741 | 6.31 | 39.816 | 251.24 |
| 6.319999999999741 | 6.32 | 39.942 | 252.436 |
| 6.329999999999741 | 6.33 | 40.069 | 253.636 |
| 6.33999999999974 | 6.34 | 40.196 | 254.84 |
| 6.34999999999974 | 6.35 | 40.322 | 256.048 |
| 6.35999999999974 | 6.36 | 40.45 | 257.259 |
| 6.36999999999974 | 6.37 | 40.577 | 258.475 |
| 6.37999999999974 | 6.38 | 40.704 | 259.694 |
| 6.38999999999974 | 6.39 | 40.832 | 260.917 |
| 6.39999999999974 | 6.4 | 40.96 | 262.144 |
| 6.409999999999738 | 6.41 | 41.088 | 263.375 |
| 6.419999999999738 | 6.42 | 41.216 | 264.609 |
| 6.429999999999738 | 6.43 | 41.345 | 265.848 |
| 6.439999999999738 | 6.44 | 41.474 | 267.09 |
| 6.449999999999738 | 6.45 | 41.602 | 268.336 |
| 6.459999999999737 | 6.46 | 41.732 | 269.586 |
| 6.469999999999737 | 6.47 | 41.861 | 270.84 |
| 6.479999999999737 | 6.48 | 41.99 | 272.098 |
| 6.489999999999737 | 6.49 | 42.12 | 273.359 |
| 6.499999999999737 | 6.5 | 42.25 | 274.625 |
| 6.509999999999736 | 6.51 | 42.38 | 275.894 |
| 6.519999999999736 | 6.52 | 42.51 | 277.168 |
| 6.529999999999736 | 6.53 | 42.641 | 278.445 |
| 6.539999999999736 | 6.54 | 42.772 | 279.726 |
| 6.549999999999736 | 6.55 | 42.902 | 281.011 |
| 6.559999999999735 | 6.56 | 43.034 | 282.3 |
| 6.569999999999735 | 6.57 | 43.165 | 283.593 |
| 6.579999999999735 | 6.58 | 43.296 | 284.89 |
| 6.589999999999735 | 6.59 | 43.428 | 286.191 |
| 6.599999999999734 | 6.6 | 43.56 | 287.496 |
| 6.609999999999734 | 6.61 | 43.692 | 288.805 |
| 6.619999999999734 | 6.62 | 43.824 | 290.118 |
| 6.629999999999734 | 6.63 | 43.957 | 291.434 |
| 6.639999999999734 | 6.64 | 44.09 | 292.755 |
| 6.649999999999734 | 6.65 | 44.222 | 294.08 |
| 6.659999999999734 | 6.66 | 44.356 | 295.408 |
| 6.669999999999733 | 6.67 | 44.489 | 296.741 |
| 6.679999999999733 | 6.68 | 44.622 | 298.078 |
| 6.689999999999733 | 6.69 | 44.756 | 299.418 |
| 6.699999999999733 | 6.7 | 44.89 | 300.763 |
| 6.709999999999732 | 6.71 | 45.024 | 302.112 |
| 6.719999999999732 | 6.72 | 45.158 | 303.464 |
| 6.729999999999732 | 6.73 | 45.293 | 304.821 |
| 6.739999999999731 | 6.74 | 45.428 | 306.182 |
| 6.749999999999731 | 6.75 | 45.562 | 307.547 |
| 6.759999999999731 | 6.76 | 45.698 | 308.916 |
| 6.769999999999731 | 6.77 | 45.833 | 310.289 |
| 6.77999999999973 | 6.78 | 45.968 | 311.666 |
| 6.78999999999973 | 6.79 | 46.104 | 313.047 |
| 6.79999999999973 | 6.8 | 46.24 | 314.432 |
| 6.80999999999973 | 6.81 | 46.376 | 315.821 |
| 6.81999999999973 | 6.82 | 46.512 | 317.215 |
| 6.82999999999973 | 6.83 | 46.649 | 318.612 |
| 6.83999999999973 | 6.84 | 46.786 | 320.014 |
| 6.84999999999973 | 6.85 | 46.922 | 321.419 |
| 6.85999999999973 | 6.86 | 47.06 | 322.829 |
| 6.86999999999973 | 6.87 | 47.197 | 324.243 |
| 6.879999999999728 | 6.88 | 47.334 | 325.661 |
| 6.889999999999728 | 6.89 | 47.472 | 327.083 |
| 6.899999999999728 | 6.9 | 47.61 | 328.509 |
| 6.909999999999728 | 6.91 | 47.748 | 329.939 |
| 6.919999999999728 | 6.92 | 47.886 | 331.374 |
| 6.929999999999727 | 6.93 | 48.025 | 332.813 |
| 6.939999999999727 | 6.94 | 48.164 | 334.255 |
| 6.949999999999727 | 6.95 | 48.302 | 335.702 |
| 6.959999999999727 | 6.96 | 48.442 | 337.154 |
| 6.969999999999727 | 6.97 | 48.581 | 338.609 |
| 6.979999999999726 | 6.98 | 48.72 | 340.068 |
| 6.989999999999726 | 6.99 | 48.86 | 341.532 |
| 6.999999999999726 | 7 | 49 | 343 |
| 7.009999999999726 | 7.01 | 49.14 | 344.472 |
| 7.019999999999726 | 7.02 | 49.28 | 345.948 |
| 7.029999999999725 | 7.03 | 49.421 | 347.429 |
| 7.039999999999725 | 7.04 | 49.562 | 348.914 |
| 7.049999999999725 | 7.05 | 49.702 | 350.403 |
| 7.059999999999725 | 7.06 | 49.844 | 351.896 |
| 7.069999999999724 | 7.07 | 49.985 | 353.393 |
| 7.079999999999724 | 7.08 | 50.126 | 354.895 |
| 7.089999999999724 | 7.09 | 50.268 | 356.401 |
| 7.099999999999724 | 7.1 | 50.41 | 357.911 |
| 7.109999999999724 | 7.11 | 50.552 | 359.425 |
| 7.119999999999724 | 7.12 | 50.694 | 360.944 |
| 7.129999999999724 | 7.13 | 50.837 | 362.467 |
| 7.139999999999723 | 7.14 | 50.98 | 363.994 |
| 7.149999999999723 | 7.15 | 51.122 | 365.526 |
| 7.159999999999723 | 7.16 | 51.266 | 367.062 |
| 7.169999999999723 | 7.17 | 51.409 | 368.602 |
| 7.179999999999722 | 7.18 | 51.552 | 370.146 |
| 7.189999999999722 | 7.19 | 51.696 | 371.695 |
| 7.199999999999722 | 7.2 | 51.84 | 373.248 |
| 7.209999999999721 | 7.21 | 51.984 | 374.805 |
| 7.219999999999721 | 7.22 | 52.128 | 376.367 |
| 7.229999999999721 | 7.23 | 52.273 | 377.933 |
| 7.23999999999972 | 7.24 | 52.418 | 379.503 |
| 7.24999999999972 | 7.25 | 52.562 | 381.078 |
| 7.25999999999972 | 7.26 | 52.708 | 382.657 |
| 7.26999999999972 | 7.27 | 52.853 | 384.241 |
| 7.27999999999972 | 7.28 | 52.998 | 385.828 |
| 7.28999999999972 | 7.29 | 53.144 | 387.42 |
| 7.29999999999972 | 7.3 | 53.29 | 389.017 |
| 7.30999999999972 | 7.31 | 53.436 | 390.618 |
| 7.31999999999972 | 7.32 | 53.582 | 392.223 |
| 7.329999999999719 | 7.33 | 53.729 | 393.833 |
| 7.33999999999972 | 7.34 | 53.876 | 395.447 |
| 7.349999999999719 | 7.35 | 54.022 | 397.065 |
| 7.359999999999719 | 7.36 | 54.17 | 398.688 |
| 7.369999999999718 | 7.37 | 54.317 | 400.316 |
| 7.379999999999718 | 7.38 | 54.464 | 401.947 |
| 7.389999999999718 | 7.39 | 54.612 | 403.583 |
| 7.399999999999718 | 7.4 | 54.76 | 405.224 |
| 7.409999999999717 | 7.41 | 54.908 | 406.869 |
| 7.419999999999717 | 7.42 | 55.056 | 408.518 |
| 7.429999999999717 | 7.43 | 55.205 | 410.172 |
| 7.439999999999717 | 7.44 | 55.354 | 411.831 |
| 7.449999999999716 | 7.45 | 55.502 | 413.494 |
| 7.459999999999716 | 7.46 | 55.652 | 415.161 |
| 7.469999999999716 | 7.47 | 55.801 | 416.833 |
| 7.479999999999716 | 7.48 | 55.95 | 418.509 |
| 7.489999999999715 | 7.49 | 56.1 | 420.19 |
| 7.499999999999715 | 7.5 | 56.25 | 421.875 |
| 7.509999999999715 | 7.51 | 56.4 | 423.565 |
| 7.519999999999715 | 7.52 | 56.55 | 425.259 |
| 7.529999999999715 | 7.53 | 56.701 | 426.958 |
| 7.539999999999714 | 7.54 | 56.852 | 428.661 |
| 7.549999999999714 | 7.55 | 57.002 | 430.369 |
| 7.559999999999714 | 7.56 | 57.154 | 432.081 |
| 7.569999999999714 | 7.57 | 57.305 | 433.798 |
| 7.579999999999714 | 7.58 | 57.456 | 435.52 |
| 7.589999999999714 | 7.59 | 57.608 | 437.245 |
| 7.599999999999714 | 7.6 | 57.76 | 438.976 |
| 7.609999999999713 | 7.61 | 57.912 | 440.711 |
| 7.619999999999713 | 7.62 | 58.064 | 442.451 |
| 7.629999999999713 | 7.63 | 58.217 | 444.195 |
| 7.639999999999713 | 7.64 | 58.37 | 445.944 |
| 7.649999999999712 | 7.65 | 58.522 | 447.697 |
| 7.659999999999712 | 7.66 | 58.676 | 449.455 |
| 7.669999999999712 | 7.67 | 58.829 | 451.218 |
| 7.679999999999712 | 7.68 | 58.982 | 452.985 |
| 7.689999999999712 | 7.69 | 59.136 | 454.757 |
| 7.699999999999711 | 7.7 | 59.29 | 456.533 |
| 7.709999999999711 | 7.71 | 59.444 | 458.314 |
| 7.719999999999711 | 7.72 | 59.598 | 460.1 |
| 7.729999999999711 | 7.73 | 59.753 | 461.89 |
| 7.73999999999971 | 7.74 | 59.908 | 463.685 |
| 7.74999999999971 | 7.75 | 60.062 | 465.484 |
| 7.75999999999971 | 7.76 | 60.218 | 467.289 |
| 7.76999999999971 | 7.77 | 60.373 | 469.097 |
| 7.77999999999971 | 7.78 | 60.528 | 470.911 |
| 7.78999999999971 | 7.79 | 60.684 | 472.729 |
| 7.79999999999971 | 7.8 | 60.84 | 474.552 |
| 7.80999999999971 | 7.81 | 60.996 | 476.38 |
| 7.819999999999709 | 7.82 | 61.152 | 478.212 |
| 7.829999999999709 | 7.83 | 61.309 | 480.049 |
| 7.839999999999708 | 7.84 | 61.466 | 481.89 |
| 7.849999999999708 | 7.85 | 61.622 | 483.737 |
| 7.859999999999708 | 7.86 | 61.78 | 485.588 |
| 7.869999999999708 | 7.87 | 61.937 | 487.443 |
| 7.879999999999707 | 7.88 | 62.094 | 489.304 |
| 7.889999999999707 | 7.89 | 62.252 | 491.169 |
| 7.899999999999707 | 7.9 | 62.41 | 493.039 |
| 7.909999999999707 | 7.91 | 62.568 | 494.914 |
| 7.919999999999706 | 7.92 | 62.726 | 496.793 |
| 7.929999999999706 | 7.93 | 62.885 | 498.677 |
| 7.939999999999706 | 7.94 | 63.044 | 500.566 |
| 7.949999999999706 | 7.95 | 63.202 | 502.46 |
| 7.959999999999705 | 7.96 | 63.362 | 504.358 |
| 7.969999999999705 | 7.97 | 63.521 | 506.262 |
| 7.979999999999705 | 7.98 | 63.68 | 508.17 |
| 7.989999999999705 | 7.99 | 63.84 | 510.082 |
| 7.999999999999705 | 8 | 64 | 512 |
| 8.009999999999703 | 8.01 | 64.16 | 513.922 |
| 8.019999999999705 | 8.02 | 64.32 | 515.85 |
| 8.029999999999704 | 8.03 | 64.481 | 517.782 |
| 8.039999999999704 | 8.04 | 64.642 | 519.718 |
| 8.049999999999704 | 8.05 | 64.802 | 521.66 |
| 8.059999999999704 | 8.06 | 64.964 | 523.607 |
| 8.069999999999704 | 8.07 | 65.125 | 525.558 |
| 8.079999999999703 | 8.08 | 65.286 | 527.514 |
| 8.089999999999703 | 8.09 | 65.448 | 529.475 |
| 8.099999999999701 | 8.1 | 65.61 | 531.441 |
| 8.109999999999703 | 8.11 | 65.772 | 533.412 |
| 8.119999999999703 | 8.12 | 65.934 | 535.387 |
| 8.129999999999702 | 8.13 | 66.097 | 537.368 |
| 8.139999999999702 | 8.14 | 66.26 | 539.353 |
| 8.1499999999997 | 8.15 | 66.422 | 541.343 |
| 8.1599999999997 | 8.16 | 66.586 | 543.338 |
| 8.1699999999997 | 8.17 | 66.749 | 545.339 |
| 8.1799999999997 | 8.18 | 66.912 | 547.343 |
| 8.1899999999997 | 8.19 | 67.076 | 549.353 |
| 8.1999999999997 | 8.2 | 67.24 | 551.368 |
| 8.2099999999997 | 8.21 | 67.404 | 553.388 |
| 8.2199999999997 | 8.22 | 67.568 | 555.412 |
| 8.2299999999997 | 8.23 | 67.733 | 557.442 |
| 8.2399999999997 | 8.24 | 67.898 | 559.476 |
| 8.2499999999997 | 8.25 | 68.062 | 561.516 |
| 8.2599999999997 | 8.26 | 68.228 | 563.56 |
| 8.2699999999997 | 8.27 | 68.393 | 565.609 |
| 8.2799999999997 | 8.28 | 68.558 | 567.664 |
| 8.289999999999697 | 8.29 | 68.724 | 569.723 |
| 8.299999999999699 | 8.3 | 68.89 | 571.787 |
| 8.309999999999699 | 8.31 | 69.056 | 573.856 |
| 8.319999999999698 | 8.32 | 69.222 | 575.93 |
| 8.329999999999698 | 8.33 | 69.389 | 578.01 |
| 8.339999999999698 | 8.34 | 69.556 | 580.094 |
| 8.349999999999698 | 8.35 | 69.722 | 582.183 |
| 8.359999999999697 | 8.36 | 69.89 | 584.277 |
| 8.369999999999697 | 8.37 | 70.057 | 586.376 |
| 8.379999999999695 | 8.38 | 70.224 | 588.48 |
| 8.389999999999697 | 8.39 | 70.392 | 590.59 |
| 8.399999999999697 | 8.4 | 70.56 | 592.704 |
| 8.409999999999696 | 8.41 | 70.728 | 594.823 |
| 8.419999999999696 | 8.42 | 70.896 | 596.948 |
| 8.429999999999694 | 8.43 | 71.065 | 599.077 |
| 8.439999999999696 | 8.44 | 71.234 | 601.212 |
| 8.449999999999696 | 8.45 | 71.402 | 603.351 |
| 8.459999999999695 | 8.46 | 71.572 | 605.496 |
| 8.469999999999695 | 8.47 | 71.741 | 607.645 |
| 8.479999999999693 | 8.48 | 71.91 | 609.8 |
| 8.489999999999695 | 8.49 | 72.08 | 611.96 |
| 8.499999999999694 | 8.5 | 72.25 | 614.125 |
| 8.509999999999694 | 8.51 | 72.42 | 616.295 |
| 8.519999999999694 | 8.52 | 72.59 | 618.47 |
| 8.529999999999694 | 8.53 | 72.761 | 620.65 |
| 8.539999999999694 | 8.54 | 72.932 | 622.836 |
| 8.549999999999693 | 8.55 | 73.102 | 625.026 |
| 8.55999999999969 | 8.56 | 73.274 | 627.222 |
| 8.56999999999969 | 8.57 | 73.445 | 629.423 |
| 8.57999999999969 | 8.58 | 73.616 | 631.629 |
| 8.58999999999969 | 8.59 | 73.788 | 633.84 |
| 8.59999999999969 | 8.6 | 73.96 | 636.056 |
| 8.60999999999969 | 8.61 | 74.132 | 638.277 |
| 8.61999999999969 | 8.62 | 74.304 | 640.504 |
| 8.62999999999969 | 8.63 | 74.477 | 642.736 |
| 8.63999999999969 | 8.64 | 74.65 | 644.973 |
| 8.64999999999969 | 8.65 | 74.822 | 647.215 |
| 8.65999999999969 | 8.66 | 74.996 | 649.462 |
| 8.66999999999969 | 8.67 | 75.169 | 651.714 |
| 8.67999999999969 | 8.68 | 75.342 | 653.972 |
| 8.68999999999969 | 8.69 | 75.516 | 656.235 |
| 8.69999999999969 | 8.7 | 75.69 | 658.503 |
| 8.70999999999969 | 8.71 | 75.864 | 660.776 |
| 8.71999999999969 | 8.72 | 76.038 | 663.055 |
| 8.72999999999969 | 8.73 | 76.213 | 665.339 |
| 8.73999999999969 | 8.74 | 76.388 | 667.628 |
| 8.74999999999969 | 8.75 | 76.562 | 669.922 |
| 8.759999999999687 | 8.76 | 76.738 | 672.221 |
| 8.769999999999689 | 8.77 | 76.913 | 674.526 |
| 8.779999999999688 | 8.78 | 77.088 | 676.836 |
| 8.789999999999688 | 8.79 | 77.264 | 679.151 |
| 8.799999999999686 | 8.8 | 77.44 | 681.472 |
| 8.809999999999688 | 8.81 | 77.616 | 683.798 |
| 8.819999999999688 | 8.82 | 77.792 | 686.129 |
| 8.829999999999687 | 8.83 | 77.969 | 688.465 |
| 8.839999999999687 | 8.84 | 78.146 | 690.807 |
| 8.849999999999685 | 8.85 | 78.322 | 693.154 |
| 8.859999999999687 | 8.86 | 78.5 | 695.506 |
| 8.869999999999687 | 8.87 | 78.677 | 697.864 |
| 8.879999999999686 | 8.88 | 78.854 | 700.227 |
| 8.889999999999686 | 8.89 | 79.032 | 702.595 |
| 8.899999999999684 | 8.9 | 79.21 | 704.969 |
| 8.909999999999686 | 8.91 | 79.388 | 707.348 |
| 8.919999999999686 | 8.92 | 79.566 | 709.732 |
| 8.929999999999685 | 8.93 | 79.745 | 712.122 |
| 8.939999999999685 | 8.94 | 79.924 | 714.517 |
| 8.949999999999685 | 8.95 | 80.102 | 716.917 |
| 8.959999999999685 | 8.96 | 80.282 | 719.323 |
| 8.969999999999684 | 8.97 | 80.461 | 721.734 |
| 8.979999999999684 | 8.98 | 80.64 | 724.151 |
| 8.989999999999682 | 8.99 | 80.82 | 726.573 |
| 8.999999999999684 | 9 | 81 | 729 |
| 9.009999999999684 | 9.01 | 81.18 | 731.433 |
| 9.019999999999683 | 9.02 | 81.36 | 733.871 |
| 9.029999999999683 | 9.03 | 81.541 | 736.314 |
| 9.039999999999681 | 9.04 | 81.722 | 738.763 |
| 9.049999999999683 | 9.05 | 81.902 | 741.218 |
| 9.05999999999968 | 9.06 | 82.084 | 743.677 |
| 9.06999999999968 | 9.07 | 82.265 | 746.143 |
| 9.07999999999968 | 9.08 | 82.446 | 748.613 |
| 9.08999999999968 | 9.09 | 82.628 | 751.089 |
| 9.09999999999968 | 9.1 | 82.81 | 753.571 |
| 9.10999999999968 | 9.11 | 82.992 | 756.058 |
| 9.11999999999968 | 9.12 | 83.174 | 758.551 |
| 9.12999999999968 | 9.13 | 83.357 | 761.048 |
| 9.13999999999968 | 9.14 | 83.54 | 763.552 |
| 9.14999999999968 | 9.15 | 83.722 | 766.061 |
| 9.15999999999968 | 9.16 | 83.906 | 768.575 |
| 9.16999999999968 | 9.17 | 84.089 | 771.095 |
| 9.17999999999968 | 9.18 | 84.272 | 773.621 |
| 9.18999999999968 | 9.19 | 84.456 | 776.152 |
| 9.19999999999968 | 9.2 | 84.64 | 778.688 |
| 9.20999999999968 | 9.21 | 84.824 | 781.23 |
| 9.21999999999968 | 9.22 | 85.008 | 783.777 |
| 9.229999999999677 | 9.23 | 85.193 | 786.33 |
| 9.239999999999679 | 9.24 | 85.378 | 788.889 |
| 9.249999999999678 | 9.25 | 85.562 | 791.453 |
| 9.259999999999678 | 9.26 | 85.748 | 794.023 |
| 9.269999999999678 | 9.27 | 85.933 | 796.598 |
| 9.279999999999678 | 9.28 | 86.118 | 799.179 |
| 9.289999999999678 | 9.29 | 86.304 | 801.765 |
| 9.299999999999677 | 9.3 | 86.49 | 804.357 |
| 9.309999999999677 | 9.31 | 86.676 | 806.954 |
| 9.319999999999675 | 9.32 | 86.862 | 809.558 |
| 9.329999999999677 | 9.33 | 87.049 | 812.166 |
| 9.339999999999677 | 9.34 | 87.236 | 814.781 |
| 9.349999999999676 | 9.35 | 87.422 | 817.4 |
| 9.359999999999676 | 9.36 | 87.61 | 820.026 |
| 9.369999999999674 | 9.37 | 87.797 | 822.657 |
| 9.379999999999676 | 9.38 | 87.984 | 825.294 |
| 9.389999999999675 | 9.39 | 88.172 | 827.936 |
| 9.399999999999675 | 9.4 | 88.36 | 830.584 |
| 9.409999999999675 | 9.41 | 88.548 | 833.238 |
| 9.419999999999675 | 9.42 | 88.736 | 835.897 |
| 9.429999999999675 | 9.43 | 88.925 | 838.562 |
| 9.439999999999674 | 9.44 | 89.114 | 841.232 |
| 9.449999999999674 | 9.45 | 89.302 | 843.909 |
| 9.459999999999672 | 9.46 | 89.492 | 846.591 |
| 9.469999999999674 | 9.47 | 89.681 | 849.278 |
| 9.479999999999674 | 9.48 | 89.87 | 851.971 |
| 9.489999999999673 | 9.49 | 90.06 | 854.67 |
| 9.499999999999673 | 9.5 | 90.25 | 857.375 |
| 9.509999999999671 | 9.51 | 90.44 | 860.085 |
| 9.519999999999673 | 9.52 | 90.63 | 862.801 |
| 9.529999999999673 | 9.53 | 90.821 | 865.523 |
| 9.539999999999672 | 9.54 | 91.012 | 868.251 |
| 9.549999999999672 | 9.55 | 91.202 | 870.984 |
| 9.55999999999967 | 9.56 | 91.394 | 873.723 |
| 9.56999999999967 | 9.57 | 91.585 | 876.467 |
| 9.57999999999967 | 9.58 | 91.776 | 879.218 |
| 9.58999999999967 | 9.59 | 91.968 | 881.974 |
| 9.59999999999967 | 9.6 | 92.16 | 884.736 |
| 9.60999999999967 | 9.61 | 92.352 | 887.504 |
| 9.61999999999967 | 9.62 | 92.544 | 890.277 |
| 9.62999999999967 | 9.63 | 92.737 | 893.056 |
| 9.63999999999967 | 9.64 | 92.93 | 895.841 |
| 9.64999999999967 | 9.65 | 93.122 | 898.632 |
| 9.65999999999967 | 9.66 | 93.316 | 901.429 |
| 9.66999999999967 | 9.67 | 93.509 | 904.231 |
| 9.67999999999967 | 9.68 | 93.702 | 907.039 |
| 9.689999999999667 | 9.69 | 93.896 | 909.853 |
| 9.699999999999669 | 9.7 | 94.09 | 912.673 |
| 9.709999999999669 | 9.71 | 94.284 | 915.499 |
| 9.719999999999668 | 9.72 | 94.478 | 918.33 |
| 9.729999999999668 | 9.73 | 94.673 | 921.167 |
| 9.739999999999666 | 9.74 | 94.868 | 924.01 |
| 9.749999999999668 | 9.75 | 95.062 | 926.859 |
| 9.759999999999668 | 9.76 | 95.258 | 929.714 |
| 9.769999999999667 | 9.77 | 95.453 | 932.575 |
| 9.779999999999667 | 9.78 | 95.648 | 935.441 |
| 9.789999999999665 | 9.79 | 95.844 | 938.314 |
| 9.799999999999667 | 9.8 | 96.04 | 941.192 |
| 9.809999999999667 | 9.81 | 96.236 | 944.076 |
| 9.819999999999666 | 9.82 | 96.432 | 946.966 |
| 9.829999999999666 | 9.83 | 96.629 | 949.862 |
| 9.839999999999664 | 9.84 | 96.826 | 952.764 |
| 9.849999999999666 | 9.85 | 97.022 | 955.672 |
| 9.859999999999665 | 9.86 | 97.22 | 958.585 |
| 9.869999999999665 | 9.87 | 97.417 | 961.505 |
| 9.879999999999663 | 9.88 | 97.614 | 964.43 |
| 9.889999999999665 | 9.89 | 97.812 | 967.362 |
| 9.899999999999665 | 9.9 | 98.01 | 970.299 |
| 9.909999999999664 | 9.91 | 98.208 | 973.242 |
| 9.919999999999664 | 9.92 | 98.406 | 976.191 |
| 9.929999999999662 | 9.93 | 98.605 | 979.147 |
| 9.939999999999664 | 9.94 | 98.804 | 982.108 |
| 9.949999999999664 | 9.95 | 99.002 | 985.075 |
| 9.95999999999966 | 9.96 | 99.202 | 988.048 |
| 9.96999999999966 | 9.97 | 99.401 | 991.027 |
| 9.97999999999966 | 9.98 | 99.6 | 994.012 |
| 9.98999999999966 | 9.99 | 99.8 | 997.003 |
| 9.99999999999966 | 10 | 100 | 1000 |